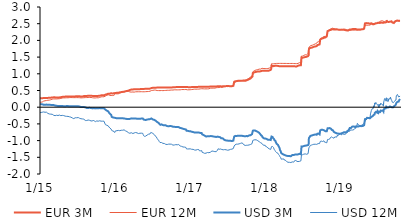
| Category | EUR 3M | EUR 12M | USD 3M | USD 12M |
|---|---|---|---|---|
| 2015-01-02 | 0.264 | 0.147 | 0.084 | -0.163 |
| 2015-01-05 | 0.265 | 0.149 | 0.086 | -0.164 |
| 2015-01-06 | 0.267 | 0.151 | 0.089 | -0.158 |
| 2015-01-07 | 0.27 | 0.151 | 0.088 | -0.157 |
| 2015-01-08 | 0.27 | 0.151 | 0.088 | -0.159 |
| 2015-01-09 | 0.27 | 0.152 | 0.086 | -0.156 |
| 2015-01-12 | 0.269 | 0.153 | 0.087 | -0.151 |
| 2015-01-13 | 0.259 | 0.152 | 0.077 | -0.152 |
| 2015-01-14 | 0.261 | 0.155 | 0.076 | -0.152 |
| 2015-01-15 | 0.261 | 0.157 | 0.077 | -0.145 |
| 2015-01-16 | 0.27 | 0.171 | 0.073 | -0.14 |
| 2015-01-19 | 0.274 | 0.181 | 0.074 | -0.142 |
| 2015-01-20 | 0.275 | 0.186 | 0.073 | -0.146 |
| 2015-01-21 | 0.275 | 0.187 | 0.073 | -0.152 |
| 2015-01-22 | 0.275 | 0.188 | 0.074 | -0.153 |
| 2015-01-23 | 0.275 | 0.188 | 0.074 | -0.153 |
| 2015-01-26 | 0.276 | 0.193 | 0.074 | -0.151 |
| 2015-01-27 | 0.275 | 0.193 | 0.077 | -0.152 |
| 2015-01-28 | 0.277 | 0.197 | 0.075 | -0.148 |
| 2015-01-29 | 0.278 | 0.199 | 0.075 | -0.15 |
| 2015-01-30 | 0.276 | 0.2 | 0.077 | -0.151 |
| 2015-02-02 | 0.275 | 0.199 | 0.078 | -0.149 |
| 2015-02-03 | 0.275 | 0.204 | 0.075 | -0.148 |
| 2015-02-04 | 0.275 | 0.207 | 0.075 | -0.155 |
| 2015-02-05 | 0.279 | 0.208 | 0.074 | -0.159 |
| 2015-02-06 | 0.277 | 0.209 | 0.074 | -0.161 |
| 2015-02-09 | 0.279 | 0.209 | 0.072 | -0.186 |
| 2015-02-10 | 0.28 | 0.208 | 0.072 | -0.194 |
| 2015-02-11 | 0.281 | 0.21 | 0.072 | -0.195 |
| 2015-02-12 | 0.282 | 0.21 | 0.072 | -0.202 |
| 2015-02-13 | 0.282 | 0.211 | 0.073 | -0.204 |
| 2015-02-16 | 0.282 | 0.212 | 0.074 | -0.203 |
| 2015-02-17 | 0.283 | 0.212 | 0.073 | -0.205 |
| 2015-02-18 | 0.282 | 0.215 | 0.069 | -0.214 |
| 2015-02-19 | 0.282 | 0.218 | 0.068 | -0.201 |
| 2015-02-20 | 0.282 | 0.22 | 0.067 | -0.204 |
| 2015-02-23 | 0.285 | 0.224 | 0.068 | -0.208 |
| 2015-02-24 | 0.286 | 0.225 | 0.069 | -0.207 |
| 2015-02-25 | 0.288 | 0.219 | 0.069 | -0.209 |
| 2015-02-26 | 0.29 | 0.222 | 0.068 | -0.209 |
| 2015-02-27 | 0.291 | 0.227 | 0.068 | -0.22 |
| 2015-03-02 | 0.291 | 0.24 | 0.069 | -0.212 |
| 2015-03-03 | 0.292 | 0.242 | 0.065 | -0.217 |
| 2015-03-04 | 0.292 | 0.243 | 0.066 | -0.219 |
| 2015-03-05 | 0.294 | 0.244 | 0.066 | -0.219 |
| 2015-03-06 | 0.294 | 0.245 | 0.065 | -0.218 |
| 2015-03-09 | 0.295 | 0.248 | 0.063 | -0.241 |
| 2015-03-10 | 0.298 | 0.251 | 0.062 | -0.241 |
| 2015-03-11 | 0.301 | 0.243 | 0.06 | -0.255 |
| 2015-03-12 | 0.303 | 0.245 | 0.059 | -0.254 |
| 2015-03-13 | 0.305 | 0.246 | 0.059 | -0.253 |
| 2015-03-16 | 0.295 | 0.248 | 0.05 | -0.253 |
| 2015-03-17 | 0.295 | 0.251 | 0.051 | -0.253 |
| 2015-03-18 | 0.285 | 0.238 | 0.04 | -0.265 |
| 2015-03-19 | 0.286 | 0.241 | 0.045 | -0.237 |
| 2015-03-20 | 0.289 | 0.245 | 0.043 | -0.247 |
| 2015-03-23 | 0.288 | 0.247 | 0.043 | -0.241 |
| 2015-03-24 | 0.289 | 0.248 | 0.041 | -0.242 |
| 2015-03-25 | 0.289 | 0.249 | 0.041 | -0.247 |
| 2015-03-26 | 0.289 | 0.249 | 0.037 | -0.25 |
| 2015-03-27 | 0.289 | 0.251 | 0.035 | -0.252 |
| 2015-03-30 | 0.292 | 0.252 | 0.036 | -0.249 |
| 2015-03-31 | 0.291 | 0.252 | 0.039 | -0.244 |
| 2015-04-01 | 0.292 | 0.254 | 0.039 | -0.248 |
| 2015-04-02 | 0.292 | 0.255 | 0.036 | -0.242 |
| 2015-04-03 | 0.292 | 0.255 | 0.036 | -0.242 |
| 2015-04-07 | 0.294 | 0.255 | 0.036 | -0.236 |
| 2015-04-08 | 0.296 | 0.259 | 0.039 | -0.239 |
| 2015-04-09 | 0.298 | 0.26 | 0.034 | -0.244 |
| 2015-04-10 | 0.298 | 0.262 | 0.033 | -0.248 |
| 2015-04-13 | 0.299 | 0.263 | 0.035 | -0.253 |
| 2015-04-14 | 0.302 | 0.267 | 0.034 | -0.25 |
| 2015-04-15 | 0.306 | 0.27 | 0.036 | -0.243 |
| 2015-04-16 | 0.308 | 0.272 | 0.035 | -0.241 |
| 2015-04-17 | 0.309 | 0.273 | 0.034 | -0.235 |
| 2015-04-20 | 0.309 | 0.274 | 0.034 | -0.245 |
| 2015-04-21 | 0.311 | 0.264 | 0.033 | -0.261 |
| 2015-04-22 | 0.312 | 0.275 | 0.032 | -0.249 |
| 2015-04-23 | 0.312 | 0.277 | 0.033 | -0.256 |
| 2015-04-24 | 0.311 | 0.278 | 0.033 | -0.256 |
| 2015-04-27 | 0.312 | 0.279 | 0.031 | -0.251 |
| 2015-04-28 | 0.315 | 0.282 | 0.032 | -0.246 |
| 2015-04-29 | 0.315 | 0.283 | 0.032 | -0.249 |
| 2015-04-30 | 0.315 | 0.279 | 0.031 | -0.255 |
| 2015-05-04 | 0.317 | 0.28 | 0.03 | -0.268 |
| 2015-05-05 | 0.318 | 0.283 | 0.03 | -0.268 |
| 2015-05-06 | 0.318 | 0.281 | 0.034 | -0.284 |
| 2015-05-07 | 0.319 | 0.281 | 0.031 | -0.286 |
| 2015-05-11 | 0.319 | 0.282 | 0.033 | -0.274 |
| 2015-05-12 | 0.319 | 0.281 | 0.035 | -0.285 |
| 2015-05-13 | 0.319 | 0.281 | 0.036 | -0.28 |
| 2015-05-14 | 0.319 | 0.282 | 0.034 | -0.273 |
| 2015-05-15 | 0.32 | 0.283 | 0.033 | -0.273 |
| 2015-05-18 | 0.321 | 0.282 | 0.034 | -0.275 |
| 2015-05-19 | 0.322 | 0.286 | 0.029 | -0.278 |
| 2015-05-20 | 0.322 | 0.288 | 0.027 | -0.289 |
| 2015-05-21 | 0.322 | 0.288 | 0.028 | -0.289 |
| 2015-05-22 | 0.322 | 0.288 | 0.026 | -0.288 |
| 2015-05-25 | 0.322 | 0.287 | 0.026 | -0.288 |
| 2015-05-26 | 0.323 | 0.289 | 0.024 | -0.307 |
| 2015-05-27 | 0.323 | 0.29 | 0.027 | -0.303 |
| 2015-05-28 | 0.323 | 0.291 | 0.027 | -0.303 |
| 2015-05-29 | 0.322 | 0.29 | 0.026 | -0.3 |
| 2015-06-01 | 0.323 | 0.289 | 0.028 | -0.298 |
| 2015-06-02 | 0.323 | 0.292 | 0.031 | -0.3 |
| 2015-06-03 | 0.324 | 0.29 | 0.031 | -0.295 |
| 2015-06-04 | 0.323 | 0.298 | 0.031 | -0.288 |
| 2015-06-05 | 0.323 | 0.299 | 0.029 | -0.289 |
| 2015-06-08 | 0.323 | 0.287 | 0.028 | -0.322 |
| 2015-06-09 | 0.323 | 0.297 | 0.025 | -0.308 |
| 2015-06-10 | 0.324 | 0.284 | 0.022 | -0.332 |
| 2015-06-11 | 0.324 | 0.289 | 0.024 | -0.338 |
| 2015-06-12 | 0.324 | 0.287 | 0.024 | -0.341 |
| 2015-06-15 | 0.324 | 0.286 | 0.027 | -0.342 |
| 2015-06-16 | 0.324 | 0.284 | 0.024 | -0.34 |
| 2015-06-17 | 0.324 | 0.284 | 0.024 | -0.341 |
| 2015-06-18 | 0.324 | 0.284 | 0.029 | -0.316 |
| 2015-06-19 | 0.324 | 0.284 | 0.029 | -0.317 |
| 2015-06-22 | 0.324 | 0.286 | 0.028 | -0.316 |
| 2015-06-23 | 0.324 | 0.287 | 0.029 | -0.319 |
| 2015-06-24 | 0.324 | 0.287 | 0.029 | -0.326 |
| 2015-06-25 | 0.325 | 0.288 | 0.028 | -0.324 |
| 2015-06-26 | 0.325 | 0.288 | 0.028 | -0.326 |
| 2015-06-29 | 0.326 | 0.287 | 0.026 | -0.316 |
| 2015-06-30 | 0.324 | 0.286 | 0.027 | -0.321 |
| 2015-07-01 | 0.324 | 0.286 | 0.026 | -0.328 |
| 2015-07-02 | 0.325 | 0.287 | 0.027 | -0.337 |
| 2015-07-03 | 0.325 | 0.287 | 0.026 | -0.322 |
| 2015-07-07 | 0.328 | 0.286 | 0.027 | -0.31 |
| 2015-07-08 | 0.328 | 0.286 | 0.027 | -0.3 |
| 2015-07-09 | 0.328 | 0.287 | 0.024 | -0.303 |
| 2015-07-10 | 0.328 | 0.286 | 0.024 | -0.313 |
| 2015-07-13 | 0.329 | 0.284 | 0.021 | -0.331 |
| 2015-07-14 | 0.329 | 0.282 | 0.022 | -0.329 |
| 2015-07-15 | 0.319 | 0.281 | 0.012 | -0.323 |
| 2015-07-16 | 0.319 | 0.281 | 0.013 | -0.323 |
| 2015-07-17 | 0.319 | 0.28 | 0.008 | -0.326 |
| 2015-07-20 | 0.319 | 0.279 | 0.005 | -0.345 |
| 2015-07-21 | 0.319 | 0.28 | 0.006 | -0.355 |
| 2015-07-22 | 0.329 | 0.279 | 0.018 | -0.355 |
| 2015-07-23 | 0.329 | 0.279 | 0.015 | -0.357 |
| 2015-07-24 | 0.319 | 0.28 | 0.006 | -0.357 |
| 2015-07-27 | 0.32 | 0.281 | 0.006 | -0.351 |
| 2015-07-28 | 0.321 | 0.281 | 0.003 | -0.354 |
| 2015-07-29 | 0.322 | 0.281 | 0.003 | -0.351 |
| 2015-07-30 | 0.323 | 0.281 | 0 | -0.364 |
| 2015-07-31 | 0.333 | 0.283 | 0.001 | -0.378 |
| 2015-08-03 | 0.333 | 0.284 | 0.006 | -0.359 |
| 2015-08-04 | 0.333 | 0.286 | 0.009 | -0.355 |
| 2015-08-05 | 0.334 | 0.287 | -0.001 | -0.382 |
| 2015-08-06 | 0.334 | 0.287 | -0.001 | -0.385 |
| 2015-08-07 | 0.334 | 0.287 | -0.002 | -0.386 |
| 2015-08-10 | 0.334 | 0.288 | -0.004 | -0.397 |
| 2015-08-11 | 0.334 | 0.288 | -0.004 | -0.389 |
| 2015-08-12 | 0.334 | 0.289 | 0.001 | -0.372 |
| 2015-08-13 | 0.334 | 0.289 | -0.011 | -0.385 |
| 2015-08-14 | 0.335 | 0.289 | -0.014 | -0.394 |
| 2015-08-17 | 0.337 | 0.289 | -0.023 | -0.399 |
| 2015-08-18 | 0.338 | 0.291 | -0.023 | -0.394 |
| 2015-08-19 | 0.339 | 0.29 | -0.023 | -0.4 |
| 2015-08-20 | 0.34 | 0.291 | -0.019 | -0.408 |
| 2015-08-21 | 0.341 | 0.29 | -0.019 | -0.398 |
| 2015-08-24 | 0.342 | 0.29 | -0.022 | -0.383 |
| 2015-08-25 | 0.343 | 0.289 | -0.017 | -0.377 |
| 2015-08-26 | 0.343 | 0.29 | -0.015 | -0.381 |
| 2015-08-27 | 0.343 | 0.29 | -0.014 | -0.392 |
| 2015-08-28 | 0.343 | 0.289 | -0.019 | -0.393 |
| 2015-08-31 | 0.343 | 0.29 | -0.019 | -0.393 |
| 2015-09-01 | 0.343 | 0.289 | -0.024 | -0.406 |
| 2015-09-02 | 0.343 | 0.29 | -0.023 | -0.404 |
| 2015-09-03 | 0.343 | 0.289 | -0.024 | -0.404 |
| 2015-09-04 | 0.344 | 0.292 | -0.022 | -0.4 |
| 2015-09-07 | 0.344 | 0.292 | -0.023 | -0.41 |
| 2015-09-08 | 0.335 | 0.282 | -0.032 | -0.417 |
| 2015-09-09 | 0.335 | 0.282 | -0.033 | -0.415 |
| 2015-09-10 | 0.336 | 0.283 | -0.036 | -0.415 |
| 2015-09-11 | 0.338 | 0.283 | -0.037 | -0.416 |
| 2015-09-14 | 0.338 | 0.283 | -0.036 | -0.415 |
| 2015-09-15 | 0.336 | 0.285 | -0.034 | -0.415 |
| 2015-09-16 | 0.347 | 0.284 | -0.03 | -0.427 |
| 2015-09-17 | 0.347 | 0.284 | -0.035 | -0.431 |
| 2015-09-18 | 0.347 | 0.286 | -0.009 | -0.385 |
| 2015-09-21 | 0.338 | 0.278 | -0.026 | -0.409 |
| 2015-09-22 | 0.339 | 0.28 | -0.027 | -0.412 |
| 2015-09-23 | 0.339 | 0.283 | -0.026 | -0.416 |
| 2015-09-24 | 0.34 | 0.282 | -0.026 | -0.417 |
| 2015-09-25 | 0.331 | 0.274 | -0.036 | -0.441 |
| 2015-09-29 | 0.331 | 0.277 | -0.036 | -0.432 |
| 2015-09-30 | 0.33 | 0.278 | -0.035 | -0.431 |
| 2015-10-01 | 0.333 | 0.28 | -0.034 | -0.427 |
| 2015-10-02 | 0.334 | 0.281 | -0.037 | -0.432 |
| 2015-10-05 | 0.336 | 0.283 | -0.033 | -0.411 |
| 2015-10-06 | 0.336 | 0.281 | -0.028 | -0.416 |
| 2015-10-07 | 0.336 | 0.28 | -0.029 | -0.42 |
| 2015-10-08 | 0.338 | 0.281 | -0.03 | -0.421 |
| 2015-10-09 | 0.339 | 0.281 | -0.031 | -0.425 |
| 2015-10-12 | 0.339 | 0.281 | -0.031 | -0.42 |
| 2015-10-13 | 0.339 | 0.281 | -0.031 | -0.415 |
| 2015-10-14 | 0.339 | 0.283 | -0.027 | -0.409 |
| 2015-10-15 | 0.342 | 0.286 | -0.025 | -0.396 |
| 2015-10-16 | 0.341 | 0.291 | -0.027 | -0.406 |
| 2015-10-19 | 0.344 | 0.292 | -0.027 | -0.406 |
| 2015-10-20 | 0.343 | 0.291 | -0.03 | -0.408 |
| 2015-10-21 | 0.343 | 0.29 | -0.026 | -0.411 |
| 2015-10-22 | 0.343 | 0.29 | -0.026 | -0.411 |
| 2015-10-23 | 0.343 | 0.29 | -0.026 | -0.411 |
| 2015-10-26 | 0.354 | 0.31 | -0.033 | -0.418 |
| 2015-10-27 | 0.356 | 0.312 | -0.034 | -0.418 |
| 2015-10-29 | 0.356 | 0.312 | -0.034 | -0.418 |
| 2015-10-30 | 0.356 | 0.312 | -0.034 | -0.418 |
| 2015-11-02 | 0.356 | 0.312 | -0.034 | -0.418 |
| 2015-11-03 | 0.356 | 0.312 | -0.034 | -0.418 |
| 2015-11-04 | 0.356 | 0.312 | -0.034 | -0.418 |
| 2015-11-05 | 0.356 | 0.312 | -0.034 | -0.418 |
| 2015-11-06 | 0.356 | 0.312 | -0.034 | -0.418 |
| 2015-11-09 | 0.356 | 0.312 | -0.034 | -0.418 |
| 2015-11-10 | 0.356 | 0.312 | -0.034 | -0.418 |
| 2015-11-11 | 0.356 | 0.312 | -0.034 | -0.418 |
| 2015-11-12 | 0.356 | 0.312 | -0.034 | -0.418 |
| 2015-11-13 | 0.356 | 0.302 | -0.034 | -0.428 |
| 2015-11-16 | 0.376 | 0.333 | -0.074 | -0.522 |
| 2015-11-18 | 0.382 | 0.334 | -0.08 | -0.526 |
| 2015-11-19 | 0.382 | 0.336 | -0.088 | -0.531 |
| 2015-11-20 | 0.385 | 0.352 | -0.092 | -0.527 |
| 2015-11-23 | 0.389 | 0.358 | -0.103 | -0.541 |
| 2015-11-24 | 0.394 | 0.362 | -0.112 | -0.547 |
| 2015-11-25 | 0.394 | 0.35 | -0.117 | -0.563 |
| 2015-11-26 | 0.399 | 0.367 | -0.122 | -0.558 |
| 2015-11-27 | 0.403 | 0.372 | -0.124 | -0.554 |
| 2015-11-30 | 0.404 | 0.372 | -0.126 | -0.561 |
| 2015-12-01 | 0.406 | 0.375 | -0.132 | -0.564 |
| 2015-12-02 | 0.408 | 0.377 | -0.146 | -0.57 |
| 2015-12-03 | 0.414 | 0.381 | -0.162 | -0.591 |
| 2015-12-04 | 0.403 | 0.352 | -0.172 | -0.598 |
| 2015-12-07 | 0.403 | 0.354 | -0.187 | -0.62 |
| 2015-12-08 | 0.406 | 0.353 | -0.196 | -0.625 |
| 2015-12-09 | 0.409 | 0.354 | -0.202 | -0.632 |
| 2015-12-10 | 0.415 | 0.356 | -0.212 | -0.635 |
| 2015-12-11 | 0.418 | 0.357 | -0.222 | -0.647 |
| 2015-12-14 | 0.419 | 0.35 | -0.228 | -0.654 |
| 2015-12-15 | 0.422 | 0.35 | -0.236 | -0.664 |
| 2015-12-16 | 0.423 | 0.351 | -0.242 | -0.674 |
| 2015-12-17 | 0.413 | 0.351 | -0.29 | -0.699 |
| 2015-12-18 | 0.411 | 0.352 | -0.306 | -0.704 |
| 2015-12-21 | 0.41 | 0.349 | -0.313 | -0.716 |
| 2015-12-22 | 0.421 | 0.36 | -0.304 | -0.711 |
| 2015-12-23 | 0.421 | 0.359 | -0.313 | -0.724 |
| 2015-12-28 | 0.421 | 0.36 | -0.313 | -0.728 |
| 2015-12-29 | 0.422 | 0.362 | -0.317 | -0.74 |
| 2015-12-30 | 0.422 | 0.361 | -0.322 | -0.755 |
| 2015-12-31 | 0.421 | 0.36 | -0.323 | -0.758 |
| 2016-01-04 | 0.422 | 0.402 | -0.322 | -0.709 |
| 2016-01-05 | 0.423 | 0.401 | -0.327 | -0.713 |
| 2016-01-06 | 0.426 | 0.404 | -0.33 | -0.705 |
| 2016-01-07 | 0.432 | 0.409 | -0.327 | -0.687 |
| 2016-01-08 | 0.433 | 0.409 | -0.331 | -0.695 |
| 2016-01-11 | 0.433 | 0.4 | -0.332 | -0.704 |
| 2016-01-12 | 0.434 | 0.402 | -0.334 | -0.706 |
| 2016-01-13 | 0.434 | 0.401 | -0.332 | -0.713 |
| 2016-01-14 | 0.433 | 0.402 | -0.331 | -0.709 |
| 2016-01-15 | 0.432 | 0.401 | -0.33 | -0.695 |
| 2016-01-18 | 0.432 | 0.401 | -0.33 | -0.695 |
| 2016-01-19 | 0.432 | 0.401 | -0.33 | -0.695 |
| 2016-01-20 | 0.432 | 0.401 | -0.33 | -0.695 |
| 2016-01-21 | 0.432 | 0.401 | -0.33 | -0.695 |
| 2016-01-22 | 0.432 | 0.401 | -0.33 | -0.695 |
| 2016-01-25 | 0.445 | 0.422 | -0.331 | -0.703 |
| 2016-01-26 | 0.448 | 0.425 | -0.331 | -0.701 |
| 2016-01-27 | 0.449 | 0.428 | -0.328 | -0.7 |
| 2016-01-28 | 0.45 | 0.428 | -0.326 | -0.701 |
| 2016-01-29 | 0.452 | 0.435 | -0.323 | -0.69 |
| 2016-02-01 | 0.452 | 0.44 | -0.329 | -0.69 |
| 2016-02-02 | 0.451 | 0.441 | -0.329 | -0.688 |
| 2016-02-03 | 0.452 | 0.442 | -0.331 | -0.68 |
| 2016-02-04 | 0.456 | 0.448 | -0.33 | -0.679 |
| 2016-02-05 | 0.457 | 0.452 | -0.33 | -0.686 |
| 2016-02-08 | 0.459 | 0.455 | -0.331 | -0.69 |
| 2016-02-09 | 0.451 | 0.454 | -0.34 | -0.681 |
| 2016-02-10 | 0.455 | 0.451 | -0.338 | -0.684 |
| 2016-02-11 | 0.459 | 0.456 | -0.337 | -0.667 |
| 2016-02-12 | 0.463 | 0.459 | -0.338 | -0.666 |
| 2016-02-15 | 0.463 | 0.458 | -0.338 | -0.678 |
| 2016-02-16 | 0.467 | 0.462 | -0.338 | -0.682 |
| 2016-02-17 | 0.469 | 0.461 | -0.339 | -0.685 |
| 2016-02-18 | 0.475 | 0.464 | -0.338 | -0.692 |
| 2016-02-19 | 0.478 | 0.467 | -0.338 | -0.69 |
| 2016-02-22 | 0.479 | 0.468 | -0.345 | -0.709 |
| 2016-02-23 | 0.48 | 0.466 | -0.349 | -0.707 |
| 2016-02-24 | 0.481 | 0.465 | -0.355 | -0.705 |
| 2016-02-25 | 0.481 | 0.465 | -0.356 | -0.71 |
| 2016-02-26 | 0.482 | 0.467 | -0.355 | -0.711 |
| 2016-02-29 | 0.485 | 0.474 | -0.353 | -0.729 |
| 2016-03-01 | 0.487 | 0.476 | -0.352 | -0.729 |
| 2016-03-02 | 0.488 | 0.474 | -0.355 | -0.746 |
| 2016-03-03 | 0.493 | 0.475 | -0.356 | -0.75 |
| 2016-03-04 | 0.495 | 0.478 | -0.353 | -0.744 |
| 2016-03-07 | 0.496 | 0.474 | -0.356 | -0.762 |
| 2016-03-08 | 0.501 | 0.475 | -0.355 | -0.757 |
| 2016-03-09 | 0.504 | 0.473 | -0.355 | -0.759 |
| 2016-03-10 | 0.509 | 0.475 | -0.352 | -0.761 |
| 2016-03-11 | 0.515 | 0.459 | -0.344 | -0.774 |
| 2016-03-14 | 0.516 | 0.458 | -0.35 | -0.781 |
| 2016-03-15 | 0.517 | 0.456 | -0.352 | -0.787 |
| 2016-03-16 | 0.52 | 0.454 | -0.349 | -0.795 |
| 2016-03-17 | 0.524 | 0.453 | -0.333 | -0.752 |
| 2016-03-18 | 0.525 | 0.453 | -0.334 | -0.761 |
| 2016-03-21 | 0.528 | 0.452 | -0.335 | -0.764 |
| 2016-03-22 | 0.529 | 0.452 | -0.338 | -0.774 |
| 2016-03-23 | 0.531 | 0.453 | -0.34 | -0.787 |
| 2016-03-24 | 0.532 | 0.455 | -0.339 | -0.781 |
| 2016-03-29 | 0.532 | 0.456 | -0.341 | -0.789 |
| 2016-03-30 | 0.533 | 0.454 | -0.335 | -0.764 |
| 2016-03-31 | 0.534 | 0.455 | -0.339 | -0.76 |
| 2016-04-01 | 0.535 | 0.452 | -0.339 | -0.763 |
| 2016-04-04 | 0.536 | 0.451 | -0.34 | -0.772 |
| 2016-04-05 | 0.538 | 0.454 | -0.337 | -0.755 |
| 2016-04-06 | 0.538 | 0.455 | -0.341 | -0.762 |
| 2016-04-07 | 0.537 | 0.457 | -0.339 | -0.756 |
| 2016-04-08 | 0.538 | 0.46 | -0.341 | -0.755 |
| 2016-04-11 | 0.541 | 0.461 | -0.34 | -0.758 |
| 2016-04-12 | 0.539 | 0.462 | -0.34 | -0.759 |
| 2016-04-13 | 0.539 | 0.463 | -0.338 | -0.768 |
| 2016-04-14 | 0.541 | 0.461 | -0.343 | -0.771 |
| 2016-04-15 | 0.539 | 0.461 | -0.343 | -0.771 |
| 2016-04-18 | 0.539 | 0.462 | -0.344 | -0.768 |
| 2016-04-19 | 0.54 | 0.461 | -0.345 | -0.775 |
| 2016-04-20 | 0.54 | 0.461 | -0.345 | -0.775 |
| 2016-04-21 | 0.54 | 0.461 | -0.345 | -0.775 |
| 2016-04-22 | 0.54 | 0.461 | -0.345 | -0.775 |
| 2016-04-25 | 0.54 | 0.463 | -0.344 | -0.789 |
| 2016-04-26 | 0.542 | 0.464 | -0.344 | -0.793 |
| 2016-04-27 | 0.541 | 0.461 | -0.348 | -0.794 |
| 2016-04-28 | 0.542 | 0.462 | -0.347 | -0.78 |
| 2016-04-29 | 0.541 | 0.462 | -0.347 | -0.78 |
| 2016-05-02 | 0.54 | 0.462 | -0.347 | -0.78 |
| 2016-05-03 | 0.541 | 0.462 | -0.343 | -0.782 |
| 2016-05-04 | 0.543 | 0.462 | -0.344 | -0.78 |
| 2016-05-05 | 0.545 | 0.463 | -0.342 | -0.78 |
| 2016-05-06 | 0.546 | 0.463 | -0.34 | -0.774 |
| 2016-05-09 | 0.548 | 0.464 | -0.34 | -0.777 |
| 2016-05-10 | 0.55 | 0.463 | -0.338 | -0.774 |
| 2016-05-11 | 0.549 | 0.462 | -0.337 | -0.775 |
| 2016-05-12 | 0.548 | 0.462 | -0.336 | -0.777 |
| 2016-05-13 | 0.547 | 0.462 | -0.338 | -0.779 |
| 2016-05-16 | 0.547 | 0.462 | -0.336 | -0.783 |
| 2016-05-17 | 0.547 | 0.461 | -0.335 | -0.792 |
| 2016-05-18 | 0.547 | 0.461 | -0.346 | -0.82 |
| 2016-05-19 | 0.548 | 0.461 | -0.364 | -0.848 |
| 2016-05-20 | 0.548 | 0.461 | -0.371 | -0.852 |
| 2016-05-23 | 0.548 | 0.462 | -0.372 | -0.853 |
| 2016-05-24 | 0.548 | 0.462 | -0.375 | -0.862 |
| 2016-05-25 | 0.548 | 0.463 | -0.377 | -0.873 |
| 2016-05-26 | 0.548 | 0.464 | -0.384 | -0.871 |
| 2016-05-27 | 0.55 | 0.465 | -0.383 | -0.867 |
| 2016-05-30 | 0.551 | 0.465 | -0.383 | -0.867 |
| 2016-05-31 | 0.551 | 0.465 | -0.396 | -0.887 |
| 2016-06-01 | 0.551 | 0.468 | -0.391 | -0.878 |
| 2016-06-02 | 0.552 | 0.467 | -0.39 | -0.882 |
| 2016-06-03 | 0.551 | 0.466 | -0.392 | -0.881 |
| 2016-06-06 | 0.552 | 0.468 | -0.371 | -0.836 |
| 2016-06-07 | 0.551 | 0.468 | -0.367 | -0.835 |
| 2016-06-08 | 0.554 | 0.468 | -0.368 | -0.828 |
| 2016-06-09 | 0.552 | 0.468 | -0.366 | -0.824 |
| 2016-06-10 | 0.553 | 0.468 | -0.366 | -0.824 |
| 2016-06-13 | 0.553 | 0.47 | -0.362 | -0.809 |
| 2016-06-14 | 0.552 | 0.471 | -0.365 | -0.803 |
| 2016-06-15 | 0.552 | 0.471 | -0.366 | -0.815 |
| 2016-06-16 | 0.554 | 0.476 | -0.357 | -0.788 |
| 2016-06-17 | 0.555 | 0.476 | -0.354 | -0.791 |
| 2016-06-20 | 0.556 | 0.478 | -0.356 | -0.802 |
| 2016-06-21 | 0.556 | 0.479 | -0.352 | -0.802 |
| 2016-06-22 | 0.558 | 0.479 | -0.35 | -0.801 |
| 2016-06-23 | 0.559 | 0.479 | -0.35 | -0.8 |
| 2016-06-24 | 0.571 | 0.497 | -0.334 | -0.755 |
| 2016-06-27 | 0.573 | 0.498 | -0.337 | -0.746 |
| 2016-06-28 | 0.571 | 0.499 | -0.341 | -0.755 |
| 2016-06-29 | 0.572 | 0.501 | -0.356 | -0.766 |
| 2016-06-30 | 0.576 | 0.501 | -0.364 | -0.78 |
| 2016-07-01 | 0.58 | 0.502 | -0.363 | -0.775 |
| 2016-07-04 | 0.581 | 0.505 | -0.366 | -0.785 |
| 2016-07-07 | 0.583 | 0.513 | -0.375 | -0.796 |
| 2016-07-08 | 0.583 | 0.509 | -0.377 | -0.803 |
| 2016-07-11 | 0.582 | 0.513 | -0.379 | -0.82 |
| 2016-07-12 | 0.581 | 0.511 | -0.383 | -0.834 |
| 2016-07-13 | 0.585 | 0.511 | -0.39 | -0.843 |
| 2016-07-14 | 0.585 | 0.511 | -0.389 | -0.848 |
| 2016-07-15 | 0.583 | 0.507 | -0.398 | -0.858 |
| 2016-07-18 | 0.585 | 0.511 | -0.406 | -0.876 |
| 2016-07-19 | 0.585 | 0.509 | -0.407 | -0.879 |
| 2016-07-20 | 0.585 | 0.509 | -0.407 | -0.879 |
| 2016-07-21 | 0.585 | 0.509 | -0.407 | -0.879 |
| 2016-07-22 | 0.585 | 0.509 | -0.407 | -0.879 |
| 2016-07-25 | 0.587 | 0.499 | -0.444 | -0.936 |
| 2016-07-26 | 0.588 | 0.498 | -0.453 | -0.949 |
| 2016-07-27 | 0.588 | 0.499 | -0.461 | -0.964 |
| 2016-07-28 | 0.586 | 0.499 | -0.466 | -0.97 |
| 2016-07-29 | 0.587 | 0.499 | -0.469 | -0.982 |
| 2016-08-01 | 0.587 | 0.498 | -0.469 | -0.984 |
| 2016-08-02 | 0.588 | 0.498 | -0.478 | -0.993 |
| 2016-08-03 | 0.589 | 0.497 | -0.488 | -1.005 |
| 2016-08-04 | 0.588 | 0.495 | -0.498 | -1.027 |
| 2016-08-05 | 0.588 | 0.497 | -0.502 | -1.025 |
| 2016-08-08 | 0.588 | 0.496 | -0.516 | -1.058 |
| 2016-08-09 | 0.588 | 0.497 | -0.526 | -1.072 |
| 2016-08-10 | 0.587 | 0.498 | -0.528 | -1.074 |
| 2016-08-11 | 0.589 | 0.499 | -0.527 | -1.07 |
| 2016-08-12 | 0.589 | 0.499 | -0.528 | -1.076 |
| 2016-08-15 | 0.588 | 0.5 | -0.514 | -1.057 |
| 2016-08-16 | 0.589 | 0.5 | -0.511 | -1.048 |
| 2016-08-17 | 0.588 | 0.499 | -0.521 | -1.07 |
| 2016-08-18 | 0.589 | 0.498 | -0.521 | -1.065 |
| 2016-08-19 | 0.588 | 0.497 | -0.527 | -1.073 |
| 2016-08-22 | 0.589 | 0.496 | -0.535 | -1.083 |
| 2016-08-23 | 0.588 | 0.497 | -0.535 | -1.081 |
| 2016-08-24 | 0.588 | 0.498 | -0.535 | -1.077 |
| 2016-08-25 | 0.588 | 0.499 | -0.539 | -1.076 |
| 2016-08-26 | 0.588 | 0.5 | -0.543 | -1.087 |
| 2016-08-29 | 0.587 | 0.5 | -0.543 | -1.087 |
| 2016-08-30 | 0.589 | 0.501 | -0.552 | -1.109 |
| 2016-08-31 | 0.589 | 0.502 | -0.549 | -1.107 |
| 2016-09-01 | 0.589 | 0.501 | -0.546 | -1.116 |
| 2016-09-02 | 0.591 | 0.502 | -0.545 | -1.109 |
| 2016-09-05 | 0.591 | 0.502 | -0.543 | -1.112 |
| 2016-09-06 | 0.593 | 0.504 | -0.551 | -1.111 |
| 2016-09-07 | 0.593 | 0.509 | -0.544 | -1.089 |
| 2016-09-08 | 0.594 | 0.51 | -0.555 | -1.09 |
| 2016-09-09 | 0.591 | 0.507 | -0.562 | -1.107 |
| 2016-09-12 | 0.593 | 0.507 | -0.566 | -1.116 |
| 2016-09-13 | 0.592 | 0.505 | -0.56 | -1.104 |
| 2016-09-14 | 0.593 | 0.504 | -0.564 | -1.106 |
| 2016-09-15 | 0.591 | 0.503 | -0.567 | -1.1 |
| 2016-09-16 | 0.591 | 0.504 | -0.567 | -1.095 |
| 2016-09-19 | 0.591 | 0.506 | -0.571 | -1.106 |
| 2016-09-20 | 0.591 | 0.507 | -0.576 | -1.115 |
| 2016-09-21 | 0.591 | 0.508 | -0.573 | -1.121 |
| 2016-09-22 | 0.591 | 0.509 | -0.567 | -1.111 |
| 2016-09-23 | 0.592 | 0.509 | -0.563 | -1.107 |
| 2016-09-26 | 0.593 | 0.51 | -0.563 | -1.105 |
| 2016-09-27 | 0.591 | 0.51 | -0.564 | -1.101 |
| 2016-09-29 | 0.591 | 0.514 | -0.556 | -1.106 |
| 2016-09-30 | 0.591 | 0.514 | -0.564 | -1.102 |
| 2016-10-03 | 0.591 | 0.514 | -0.568 | -1.109 |
| 2016-10-04 | 0.591 | 0.514 | -0.574 | -1.116 |
| 2016-10-05 | 0.592 | 0.514 | -0.578 | -1.123 |
| 2016-10-06 | 0.594 | 0.514 | -0.582 | -1.131 |
| 2016-10-07 | 0.594 | 0.513 | -0.586 | -1.137 |
| 2016-10-10 | 0.595 | 0.514 | -0.584 | -1.136 |
| 2016-10-11 | 0.596 | 0.516 | -0.587 | -1.141 |
| 2016-10-12 | 0.599 | 0.519 | -0.591 | -1.146 |
| 2016-10-13 | 0.601 | 0.521 | -0.59 | -1.137 |
| 2016-10-14 | 0.601 | 0.522 | -0.592 | -1.136 |
| 2016-10-17 | 0.601 | 0.521 | -0.588 | -1.131 |
| 2016-10-18 | 0.602 | 0.523 | -0.591 | -1.121 |
| 2016-10-19 | 0.603 | 0.523 | -0.591 | -1.114 |
| 2016-10-20 | 0.603 | 0.523 | -0.592 | -1.116 |
| 2016-10-21 | 0.602 | 0.524 | -0.592 | -1.122 |
| 2016-10-24 | 0.601 | 0.52 | -0.594 | -1.121 |
| 2016-10-25 | 0.602 | 0.521 | -0.596 | -1.128 |
| 2016-10-26 | 0.603 | 0.52 | -0.6 | -1.13 |
| 2016-10-27 | 0.602 | 0.52 | -0.597 | -1.132 |
| 2016-10-31 | 0.603 | 0.519 | -0.594 | -1.125 |
| 2016-11-01 | 0.603 | 0.519 | -0.591 | -1.126 |
| 2016-11-02 | 0.603 | 0.521 | -0.586 | -1.115 |
| 2016-11-03 | 0.603 | 0.521 | -0.591 | -1.11 |
| 2016-11-04 | 0.602 | 0.521 | -0.593 | -1.109 |
| 2016-11-07 | 0.602 | 0.52 | -0.597 | -1.118 |
| 2016-11-08 | 0.602 | 0.52 | -0.592 | -1.118 |
| 2016-11-09 | 0.602 | 0.52 | -0.596 | -1.106 |
| 2016-11-10 | 0.602 | 0.521 | -0.612 | -1.133 |
| 2016-11-11 | 0.602 | 0.519 | -0.616 | -1.138 |
| 2016-11-14 | 0.602 | 0.52 | -0.621 | -1.16 |
| 2016-11-15 | 0.602 | 0.521 | -0.616 | -1.155 |
| 2016-11-16 | 0.601 | 0.523 | -0.619 | -1.162 |
| 2016-11-18 | 0.603 | 0.527 | -0.626 | -1.171 |
| 2016-11-21 | 0.602 | 0.528 | -0.63 | -1.173 |
| 2016-11-22 | 0.603 | 0.529 | -0.635 | -1.178 |
| 2016-11-23 | 0.603 | 0.528 | -0.64 | -1.18 |
| 2016-11-24 | 0.604 | 0.529 | -0.647 | -1.193 |
| 2016-11-25 | 0.604 | 0.529 | -0.647 | -1.195 |
| 2016-11-28 | 0.604 | 0.529 | -0.645 | -1.191 |
| 2016-11-29 | 0.604 | 0.529 | -0.641 | -1.191 |
| 2016-11-30 | 0.604 | 0.53 | -0.644 | -1.189 |
| 2016-12-01 | 0.603 | 0.529 | -0.652 | -1.193 |
| 2016-12-02 | 0.603 | 0.526 | -0.656 | -1.195 |
| 2016-12-05 | 0.603 | 0.528 | -0.658 | -1.194 |
| 2016-12-06 | 0.605 | 0.529 | -0.661 | -1.196 |
| 2016-12-07 | 0.606 | 0.528 | -0.661 | -1.195 |
| 2016-12-08 | 0.608 | 0.528 | -0.663 | -1.195 |
| 2016-12-09 | 0.606 | 0.531 | -0.667 | -1.198 |
| 2016-12-12 | 0.606 | 0.531 | -0.669 | -1.205 |
| 2016-12-13 | 0.606 | 0.531 | -0.673 | -1.204 |
| 2016-12-14 | 0.606 | 0.532 | -0.68 | -1.205 |
| 2016-12-15 | 0.606 | 0.531 | -0.703 | -1.25 |
| 2016-12-16 | 0.604 | 0.531 | -0.707 | -1.243 |
| 2016-12-19 | 0.603 | 0.521 | -0.704 | -1.252 |
| 2016-12-20 | 0.603 | 0.521 | -0.706 | -1.251 |
| 2016-12-21 | 0.605 | 0.522 | -0.708 | -1.25 |
| 2016-12-22 | 0.596 | 0.522 | -0.717 | -1.248 |
| 2016-12-23 | 0.597 | 0.522 | -0.717 | -1.25 |
| 2016-12-27 | 0.598 | 0.521 | -0.717 | -1.25 |
| 2016-12-28 | 0.589 | 0.512 | -0.728 | -1.26 |
| 2016-12-29 | 0.599 | 0.521 | -0.718 | -1.247 |
| 2016-12-30 | 0.599 | 0.522 | -0.718 | -1.246 |
| 2017-01-02 | 0.598 | 0.523 | -0.718 | -1.246 |
| 2017-01-03 | 0.599 | 0.524 | -0.719 | -1.249 |
| 2017-01-04 | 0.6 | 0.525 | -0.725 | -1.249 |
| 2017-01-05 | 0.601 | 0.525 | -0.729 | -1.249 |
| 2017-01-06 | 0.601 | 0.527 | -0.73 | -1.245 |
| 2017-01-09 | 0.602 | 0.528 | -0.735 | -1.261 |
| 2017-01-10 | 0.604 | 0.53 | -0.738 | -1.262 |
| 2017-01-11 | 0.606 | 0.531 | -0.742 | -1.263 |
| 2017-01-12 | 0.607 | 0.533 | -0.742 | -1.258 |
| 2017-01-13 | 0.607 | 0.534 | -0.743 | -1.258 |
| 2017-01-16 | 0.608 | 0.535 | -0.744 | -1.262 |
| 2017-01-17 | 0.609 | 0.538 | -0.745 | -1.262 |
| 2017-01-18 | 0.609 | 0.539 | -0.75 | -1.27 |
| 2017-01-19 | 0.609 | 0.54 | -0.761 | -1.288 |
| 2017-01-20 | 0.609 | 0.54 | -0.761 | -1.288 |
| 2017-01-23 | 0.607 | 0.541 | -0.758 | -1.281 |
| 2017-01-24 | 0.608 | 0.541 | -0.752 | -1.267 |
| 2017-01-25 | 0.608 | 0.541 | -0.757 | -1.279 |
| 2017-01-26 | 0.608 | 0.542 | -0.759 | -1.288 |
| 2017-01-27 | 0.608 | 0.541 | -0.759 | -1.284 |
| 2017-01-30 | 0.608 | 0.54 | -0.754 | -1.285 |
| 2017-01-31 | 0.607 | 0.541 | -0.755 | -1.273 |
| 2017-02-01 | 0.608 | 0.543 | -0.755 | -1.275 |
| 2017-02-02 | 0.608 | 0.542 | -0.754 | -1.272 |
| 2017-02-03 | 0.608 | 0.541 | -0.754 | -1.273 |
| 2017-02-06 | 0.608 | 0.541 | -0.758 | -1.267 |
| 2017-02-07 | 0.608 | 0.541 | -0.758 | -1.265 |
| 2017-02-08 | 0.608 | 0.541 | -0.754 | -1.26 |
| 2017-02-09 | 0.608 | 0.541 | -0.754 | -1.254 |
| 2017-02-10 | 0.609 | 0.541 | -0.756 | -1.263 |
| 2017-02-13 | 0.609 | 0.542 | -0.759 | -1.27 |
| 2017-02-14 | 0.608 | 0.544 | -0.757 | -1.268 |
| 2017-02-15 | 0.608 | 0.544 | -0.762 | -1.284 |
| 2017-02-16 | 0.608 | 0.546 | -0.776 | -1.305 |
| 2017-02-17 | 0.609 | 0.549 | -0.772 | -1.295 |
| 2017-02-20 | 0.609 | 0.549 | -0.77 | -1.295 |
| 2017-02-21 | 0.609 | 0.551 | -0.773 | -1.305 |
| 2017-02-22 | 0.61 | 0.551 | -0.774 | -1.306 |
| 2017-02-23 | 0.609 | 0.551 | -0.772 | -1.304 |
| 2017-02-24 | 0.609 | 0.553 | -0.774 | -1.3 |
| 2017-02-27 | 0.609 | 0.553 | -0.775 | -1.3 |
| 2017-02-28 | 0.61 | 0.554 | -0.784 | -1.316 |
| 2017-03-01 | 0.609 | 0.554 | -0.813 | -1.35 |
| 2017-03-02 | 0.609 | 0.554 | -0.82 | -1.358 |
| 2017-03-03 | 0.609 | 0.553 | -0.822 | -1.368 |
| 2017-03-06 | 0.609 | 0.551 | -0.826 | -1.36 |
| 2017-03-07 | 0.608 | 0.551 | -0.826 | -1.36 |
| 2017-03-08 | 0.609 | 0.551 | -0.829 | -1.361 |
| 2017-03-09 | 0.609 | 0.551 | -0.84 | -1.374 |
| 2017-03-10 | 0.609 | 0.549 | -0.841 | -1.378 |
| 2017-03-13 | 0.61 | 0.548 | -0.851 | -1.381 |
| 2017-03-14 | 0.61 | 0.548 | -0.857 | -1.383 |
| 2017-03-15 | 0.609 | 0.55 | -0.868 | -1.388 |
| 2017-03-16 | 0.609 | 0.551 | -0.872 | -1.374 |
| 2017-03-17 | 0.609 | 0.549 | -0.872 | -1.373 |
| 2017-03-20 | 0.609 | 0.549 | -0.876 | -1.376 |
| 2017-03-21 | 0.609 | 0.546 | -0.876 | -1.375 |
| 2017-03-22 | 0.61 | 0.546 | -0.877 | -1.367 |
| 2017-03-23 | 0.61 | 0.547 | -0.873 | -1.364 |
| 2017-03-24 | 0.61 | 0.547 | -0.871 | -1.363 |
| 2017-03-27 | 0.61 | 0.549 | -0.872 | -1.357 |
| 2017-03-28 | 0.61 | 0.55 | -0.872 | -1.358 |
| 2017-03-29 | 0.61 | 0.549 | -0.867 | -1.354 |
| 2017-03-30 | 0.61 | 0.549 | -0.868 | -1.353 |
| 2017-03-31 | 0.609 | 0.549 | -0.87 | -1.362 |
| 2017-04-03 | 0.61 | 0.551 | -0.87 | -1.363 |
| 2017-04-04 | 0.61 | 0.551 | -0.87 | -1.352 |
| 2017-04-05 | 0.609 | 0.554 | -0.87 | -1.356 |
| 2017-04-06 | 0.61 | 0.555 | -0.875 | -1.358 |
| 2017-04-07 | 0.62 | 0.556 | -0.868 | -1.359 |
| 2017-04-10 | 0.622 | 0.568 | -0.866 | -1.348 |
| 2017-04-11 | 0.622 | 0.569 | -0.865 | -1.339 |
| 2017-04-12 | 0.622 | 0.57 | -0.868 | -1.333 |
| 2017-04-13 | 0.621 | 0.57 | -0.868 | -1.322 |
| 2017-04-18 | 0.621 | 0.572 | -0.866 | -1.311 |
| 2017-04-19 | 0.622 | 0.573 | -0.866 | -1.286 |
| 2017-04-20 | 0.622 | 0.574 | -0.863 | -1.289 |
| 2017-04-21 | 0.621 | 0.574 | -0.866 | -1.295 |
| 2017-04-24 | 0.619 | 0.571 | -0.876 | -1.318 |
| 2017-04-25 | 0.619 | 0.571 | -0.88 | -1.325 |
| 2017-04-26 | 0.619 | 0.571 | -0.882 | -1.333 |
| 2017-04-27 | 0.619 | 0.571 | -0.88 | -1.326 |
| 2017-04-28 | 0.619 | 0.571 | -0.882 | -1.324 |
| 2017-05-02 | 0.619 | 0.571 | -0.884 | -1.33 |
| 2017-05-03 | 0.619 | 0.575 | -0.881 | -1.32 |
| 2017-05-04 | 0.619 | 0.576 | -0.889 | -1.331 |
| 2017-05-05 | 0.619 | 0.574 | -0.89 | -1.329 |
| 2017-05-09 | 0.619 | 0.583 | -0.892 | -1.331 |
| 2017-05-10 | 0.619 | 0.584 | -0.891 | -1.328 |
| 2017-05-11 | 0.629 | 0.584 | -0.882 | -1.326 |
| 2017-05-12 | 0.629 | 0.587 | -0.88 | -1.306 |
| 2017-05-15 | 0.63 | 0.587 | -0.879 | -1.285 |
| 2017-05-16 | 0.631 | 0.588 | -0.881 | -1.285 |
| 2017-05-17 | 0.631 | 0.589 | -0.878 | -1.273 |
| 2017-05-18 | 0.631 | 0.589 | -0.872 | -1.245 |
| 2017-05-19 | 0.631 | 0.589 | -0.886 | -1.263 |
| 2017-05-22 | 0.629 | 0.589 | -0.892 | -1.266 |
| 2017-05-23 | 0.63 | 0.589 | -0.889 | -1.26 |
| 2017-05-24 | 0.629 | 0.599 | -0.898 | -1.256 |
| 2017-05-25 | 0.629 | 0.599 | -0.9 | -1.253 |
| 2017-05-26 | 0.629 | 0.6 | -0.902 | -1.251 |
| 2017-05-29 | 0.629 | 0.601 | -0.902 | -1.251 |
| 2017-05-30 | 0.629 | 0.591 | -0.902 | -1.262 |
| 2017-05-31 | 0.629 | 0.591 | -0.91 | -1.264 |
| 2017-06-01 | 0.629 | 0.591 | -0.918 | -1.266 |
| 2017-06-02 | 0.619 | 0.591 | -0.932 | -1.271 |
| 2017-06-05 | 0.619 | 0.591 | -0.93 | -1.266 |
| 2017-06-06 | 0.619 | 0.593 | -0.929 | -1.263 |
| 2017-06-07 | 0.619 | 0.594 | -0.931 | -1.264 |
| 2017-06-08 | 0.62 | 0.594 | -0.938 | -1.268 |
| 2017-06-09 | 0.631 | 0.6 | -0.936 | -1.268 |
| 2017-06-12 | 0.631 | 0.607 | -0.942 | -1.276 |
| 2017-06-13 | 0.631 | 0.609 | -0.946 | -1.276 |
| 2017-06-14 | 0.631 | 0.612 | -0.95 | -1.276 |
| 2017-06-15 | 0.629 | 0.612 | -0.967 | -1.27 |
| 2017-06-16 | 0.629 | 0.614 | -0.974 | -1.272 |
| 2017-06-19 | 0.629 | 0.616 | -0.98 | -1.268 |
| 2017-06-20 | 0.629 | 0.619 | -0.987 | -1.276 |
| 2017-06-21 | 0.629 | 0.621 | -0.989 | -1.275 |
| 2017-06-22 | 0.63 | 0.621 | -0.996 | -1.278 |
| 2017-06-23 | 0.631 | 0.623 | -0.993 | -1.273 |
| 2017-06-26 | 0.631 | 0.621 | -0.995 | -1.275 |
| 2017-06-27 | 0.631 | 0.621 | -0.995 | -1.273 |
| 2017-06-28 | 0.631 | 0.618 | -0.996 | -1.277 |
| 2017-06-29 | 0.621 | 0.616 | -1.009 | -1.28 |
| 2017-06-30 | 0.631 | 0.616 | -0.999 | -1.278 |
| 2017-07-03 | 0.631 | 0.617 | -1.001 | -1.288 |
| 2017-07-04 | 0.629 | 0.619 | -1.002 | -1.291 |
| 2017-07-07 | 0.631 | 0.631 | -1.005 | -1.288 |
| 2017-07-10 | 0.631 | 0.626 | -1.004 | -1.281 |
| 2017-07-11 | 0.631 | 0.625 | -1.004 | -1.282 |
| 2017-07-12 | 0.631 | 0.624 | -1.004 | -1.276 |
| 2017-07-13 | 0.631 | 0.621 | -1.004 | -1.268 |
| 2017-07-14 | 0.631 | 0.621 | -1.004 | -1.27 |
| 2017-07-17 | 0.63 | 0.621 | -1.006 | -1.263 |
| 2017-07-18 | 0.631 | 0.621 | -1.007 | -1.263 |
| 2017-07-19 | 0.632 | 0.621 | -1.007 | -1.263 |
| 2017-07-20 | 0.632 | 0.621 | -1.007 | -1.263 |
| 2017-07-21 | 0.632 | 0.621 | -1.007 | -1.263 |
| 2017-07-24 | 0.629 | 0.633 | -1.014 | -1.256 |
| 2017-07-25 | 0.629 | 0.633 | -1.017 | -1.259 |
| 2017-07-26 | 0.63 | 0.633 | -1.014 | -1.256 |
| 2017-07-27 | 0.629 | 0.633 | -1.011 | -1.25 |
| 2017-07-28 | 0.639 | 0.632 | -1.001 | -1.249 |
| 2017-07-31 | 0.64 | 0.641 | -1.001 | -1.237 |
| 2017-08-01 | 0.641 | 0.641 | -1.001 | -1.236 |
| 2017-08-02 | 0.641 | 0.643 | -1.003 | -1.236 |
| 2017-08-03 | 0.639 | 0.642 | -1.002 | -1.236 |
| 2017-08-04 | 0.759 | 0.711 | -0.882 | -1.163 |
| 2017-08-07 | 0.768 | 0.742 | -0.871 | -1.142 |
| 2017-08-08 | 0.768 | 0.752 | -0.869 | -1.13 |
| 2017-08-09 | 0.778 | 0.753 | -0.859 | -1.128 |
| 2017-08-10 | 0.779 | 0.764 | -0.859 | -1.118 |
| 2017-08-11 | 0.779 | 0.766 | -0.865 | -1.115 |
| 2017-08-14 | 0.779 | 0.768 | -0.864 | -1.108 |
| 2017-08-15 | 0.779 | 0.767 | -0.864 | -1.118 |
| 2017-08-16 | 0.779 | 0.777 | -0.867 | -1.116 |
| 2017-08-17 | 0.789 | 0.778 | -0.856 | -1.113 |
| 2017-08-18 | 0.789 | 0.778 | -0.855 | -1.106 |
| 2017-08-21 | 0.789 | 0.778 | -0.854 | -1.107 |
| 2017-08-22 | 0.788 | 0.788 | -0.857 | -1.097 |
| 2017-08-23 | 0.789 | 0.789 | -0.857 | -1.098 |
| 2017-08-24 | 0.789 | 0.789 | -0.857 | -1.093 |
| 2017-08-25 | 0.789 | 0.789 | -0.858 | -1.098 |
| 2017-08-28 | 0.789 | 0.789 | -0.858 | -1.098 |
| 2017-08-29 | 0.79 | 0.79 | -0.857 | -1.084 |
| 2017-08-30 | 0.79 | 0.791 | -0.856 | -1.082 |
| 2017-08-31 | 0.789 | 0.791 | -0.858 | -1.083 |
| 2017-09-01 | 0.789 | 0.791 | -0.856 | -1.082 |
| 2017-09-04 | 0.789 | 0.791 | -0.856 | -1.083 |
| 2017-09-05 | 0.789 | 0.791 | -0.857 | -1.085 |
| 2017-09-06 | 0.789 | 0.793 | -0.857 | -1.078 |
| 2017-09-07 | 0.79 | 0.792 | -0.857 | -1.079 |
| 2017-09-08 | 0.791 | 0.796 | -0.85 | -1.065 |
| 2017-09-11 | 0.791 | 0.798 | -0.857 | -1.069 |
| 2017-09-12 | 0.79 | 0.809 | -0.859 | -1.07 |
| 2017-09-13 | 0.789 | 0.809 | -0.86 | -1.072 |
| 2017-09-14 | 0.789 | 0.811 | -0.861 | -1.08 |
| 2017-09-15 | 0.789 | 0.811 | -0.864 | -1.092 |
| 2017-09-18 | 0.789 | 0.811 | -0.865 | -1.1 |
| 2017-09-19 | 0.79 | 0.811 | -0.866 | -1.104 |
| 2017-09-20 | 0.789 | 0.811 | -0.863 | -1.107 |
| 2017-09-21 | 0.79 | 0.811 | -0.868 | -1.128 |
| 2017-09-22 | 0.789 | 0.811 | -0.869 | -1.135 |
| 2017-09-25 | 0.789 | 0.811 | -0.87 | -1.135 |
| 2017-09-26 | 0.789 | 0.811 | -0.871 | -1.136 |
| 2017-09-27 | 0.799 | 0.811 | -0.863 | -1.145 |
| 2017-09-29 | 0.799 | 0.822 | -0.864 | -1.132 |
| 2017-10-02 | 0.799 | 0.822 | -0.866 | -1.141 |
| 2017-10-03 | 0.8 | 0.821 | -0.872 | -1.149 |
| 2017-10-04 | 0.799 | 0.818 | -0.877 | -1.148 |
| 2017-10-05 | 0.809 | 0.831 | -0.869 | -1.14 |
| 2017-10-06 | 0.819 | 0.833 | -0.86 | -1.145 |
| 2017-10-09 | 0.819 | 0.846 | -0.866 | -1.139 |
| 2017-10-10 | 0.819 | 0.851 | -0.867 | -1.137 |
| 2017-10-11 | 0.819 | 0.841 | -0.869 | -1.15 |
| 2017-10-12 | 0.819 | 0.841 | -0.869 | -1.148 |
| 2017-10-13 | 0.829 | 0.851 | -0.853 | -1.143 |
| 2017-10-16 | 0.839 | 0.862 | -0.844 | -1.13 |
| 2017-10-17 | 0.839 | 0.873 | -0.847 | -1.131 |
| 2017-10-18 | 0.849 | 0.883 | -0.843 | -1.135 |
| 2017-10-19 | 0.849 | 0.893 | -0.842 | -1.118 |
| 2017-10-20 | 0.849 | 0.893 | -0.842 | -1.118 |
| 2017-10-23 | 0.859 | 0.903 | -0.837 | -1.115 |
| 2017-10-24 | 0.87 | 0.903 | -0.831 | -1.115 |
| 2017-10-25 | 0.871 | 0.913 | -0.834 | -1.115 |
| 2017-10-26 | 0.881 | 0.923 | -0.828 | -1.103 |
| 2017-10-27 | 0.891 | 0.924 | -0.82 | -1.108 |
| 2017-10-30 | 0.901 | 0.935 | -0.807 | -1.092 |
| 2017-10-31 | 0.911 | 0.955 | -0.801 | -1.078 |
| 2017-11-01 | 0.919 | 0.957 | -0.795 | -1.086 |
| 2017-11-02 | 0.939 | 0.979 | -0.781 | -1.073 |
| 2017-11-03 | 1.019 | 1.061 | -0.702 | -0.993 |
| 2017-11-06 | 1.029 | 1.081 | -0.697 | -0.974 |
| 2017-11-07 | 1.029 | 1.08 | -0.703 | -0.978 |
| 2017-11-08 | 1.039 | 1.081 | -0.7 | -0.983 |
| 2017-11-09 | 1.049 | 1.091 | -0.693 | -0.982 |
| 2017-11-10 | 1.049 | 1.101 | -0.693 | -0.971 |
| 2017-11-13 | 1.049 | 1.101 | -0.696 | -0.974 |
| 2017-11-14 | 1.049 | 1.111 | -0.699 | -0.973 |
| 2017-11-15 | 1.049 | 1.112 | -0.702 | -0.966 |
| 2017-11-16 | 1.049 | 1.122 | -0.716 | -0.971 |
| 2017-11-20 | 1.059 | 1.117 | -0.716 | -0.978 |
| 2017-11-21 | 1.059 | 1.126 | -0.724 | -0.987 |
| 2017-11-22 | 1.059 | 1.126 | -0.732 | -0.994 |
| 2017-11-23 | 1.059 | 1.126 | -0.732 | -0.99 |
| 2017-11-24 | 1.069 | 1.126 | -0.728 | -0.996 |
| 2017-11-27 | 1.069 | 1.126 | -0.737 | -1.003 |
| 2017-11-28 | 1.069 | 1.126 | -0.739 | -0.998 |
| 2017-11-29 | 1.069 | 1.137 | -0.741 | -0.995 |
| 2017-11-30 | 1.069 | 1.138 | -0.747 | -1.002 |
| 2017-12-01 | 1.066 | 1.128 | -0.755 | -1.02 |
| 2017-12-04 | 1.066 | 1.14 | -0.768 | -1.032 |
| 2017-12-05 | 1.066 | 1.141 | -0.775 | -1.04 |
| 2017-12-06 | 1.066 | 1.141 | -0.783 | -1.038 |
| 2017-12-07 | 1.065 | 1.14 | -0.796 | -1.047 |
| 2017-12-08 | 1.076 | 1.141 | -0.799 | -1.061 |
| 2017-12-11 | 1.077 | 1.141 | -0.813 | -1.064 |
| 2017-12-12 | 1.077 | 1.141 | -0.824 | -1.078 |
| 2017-12-13 | 1.079 | 1.151 | -0.838 | -1.079 |
| 2017-12-14 | 1.091 | 1.162 | -0.84 | -1.069 |
| 2017-12-15 | 1.089 | 1.163 | -0.853 | -1.078 |
| 2017-12-18 | 1.089 | 1.164 | -0.865 | -1.088 |
| 2017-12-19 | 1.089 | 1.164 | -0.882 | -1.099 |
| 2017-12-20 | 1.089 | 1.158 | -0.898 | -1.114 |
| 2017-12-21 | 1.089 | 1.156 | -0.915 | -1.121 |
| 2017-12-22 | 1.089 | 1.156 | -0.926 | -1.132 |
| 2017-12-27 | 1.089 | 1.156 | -0.933 | -1.141 |
| 2017-12-28 | 1.089 | 1.156 | -0.935 | -1.136 |
| 2017-12-29 | 1.089 | 1.156 | -0.934 | -1.137 |
| 2018-01-02 | 1.089 | 1.156 | -0.937 | -1.139 |
| 2018-01-03 | 1.089 | 1.157 | -0.936 | -1.148 |
| 2018-01-04 | 1.089 | 1.157 | -0.944 | -1.168 |
| 2018-01-05 | 1.089 | 1.157 | -0.944 | -1.18 |
| 2018-01-08 | 1.089 | 1.157 | -0.948 | -1.181 |
| 2018-01-09 | 1.089 | 1.157 | -0.945 | -1.176 |
| 2018-01-10 | 1.089 | 1.156 | -0.949 | -1.186 |
| 2018-01-11 | 1.109 | 1.178 | -0.94 | -1.174 |
| 2018-01-12 | 1.089 | 1.156 | -0.962 | -1.203 |
| 2018-01-15 | 1.089 | 1.157 | -0.971 | -1.219 |
| 2018-01-16 | 1.089 | 1.156 | -0.974 | -1.226 |
| 2018-01-17 | 1.098 | 1.166 | -0.969 | -1.234 |
| 2018-01-18 | 1.098 | 1.171 | -0.975 | -1.248 |
| 2018-01-19 | 1.098 | 1.171 | -0.974 | -1.248 |
| 2018-01-22 | 1.098 | 1.171 | -0.971 | -1.248 |
| 2018-01-23 | 1.098 | 1.171 | -0.975 | -1.245 |
| 2018-01-24 | 1.098 | 1.172 | -0.982 | -1.251 |
| 2018-01-25 | 1.108 | 1.182 | -0.972 | -1.241 |
| 2018-01-26 | 1.108 | 1.182 | -0.972 | -1.241 |
| 2018-01-29 | 1.118 | 1.191 | -0.982 | -1.264 |
| 2018-01-30 | 1.138 | 1.201 | -0.963 | -1.253 |
| 2018-01-31 | 1.138 | 1.211 | -0.968 | -1.247 |
| 2018-02-01 | 1.158 | 1.221 | -0.957 | -1.263 |
| 2018-02-02 | 1.239 | 1.301 | -0.879 | -1.181 |
| 2018-02-05 | 1.239 | 1.301 | -0.883 | -1.183 |
| 2018-02-06 | 1.239 | 1.301 | -0.881 | -1.168 |
| 2018-02-07 | 1.239 | 1.301 | -0.89 | -1.176 |
| 2018-02-08 | 1.239 | 1.301 | -0.9 | -1.188 |
| 2018-02-09 | 1.229 | 1.301 | -0.92 | -1.203 |
| 2018-02-12 | 1.229 | 1.301 | -0.933 | -1.209 |
| 2018-02-13 | 1.229 | 1.301 | -0.939 | -1.217 |
| 2018-02-14 | 1.228 | 1.302 | -0.95 | -1.228 |
| 2018-02-15 | 1.228 | 1.301 | -0.972 | -1.271 |
| 2018-02-16 | 1.228 | 1.302 | -0.985 | -1.281 |
| 2018-02-19 | 1.239 | 1.303 | -0.982 | -1.288 |
| 2018-02-20 | 1.239 | 1.303 | -0.994 | -1.298 |
| 2018-02-21 | 1.239 | 1.301 | -1.01 | -1.316 |
| 2018-02-22 | 1.238 | 1.311 | -1.034 | -1.33 |
| 2018-02-23 | 1.238 | 1.311 | -1.046 | -1.34 |
| 2018-02-26 | 1.238 | 1.31 | -1.074 | -1.349 |
| 2018-02-27 | 1.238 | 1.311 | -1.096 | -1.361 |
| 2018-02-28 | 1.237 | 1.311 | -1.107 | -1.382 |
| 2018-03-01 | 1.237 | 1.311 | -1.115 | -1.387 |
| 2018-03-02 | 1.237 | 1.311 | -1.115 | -1.377 |
| 2018-03-05 | 1.237 | 1.311 | -1.125 | -1.378 |
| 2018-03-06 | 1.237 | 1.311 | -1.137 | -1.392 |
| 2018-03-07 | 1.237 | 1.311 | -1.147 | -1.399 |
| 2018-03-08 | 1.237 | 1.311 | -1.161 | -1.413 |
| 2018-03-09 | 1.227 | 1.311 | -1.189 | -1.424 |
| 2018-03-12 | 1.227 | 1.311 | -1.207 | -1.443 |
| 2018-03-13 | 1.227 | 1.311 | -1.224 | -1.458 |
| 2018-03-14 | 1.227 | 1.311 | -1.245 | -1.47 |
| 2018-03-15 | 1.228 | 1.311 | -1.278 | -1.481 |
| 2018-03-16 | 1.228 | 1.312 | -1.302 | -1.494 |
| 2018-03-19 | 1.229 | 1.312 | -1.322 | -1.513 |
| 2018-03-20 | 1.229 | 1.311 | -1.348 | -1.531 |
| 2018-03-21 | 1.229 | 1.311 | -1.371 | -1.556 |
| 2018-03-22 | 1.229 | 1.311 | -1.386 | -1.557 |
| 2018-03-23 | 1.229 | 1.31 | -1.392 | -1.546 |
| 2018-03-26 | 1.229 | 1.311 | -1.395 | -1.552 |
| 2018-03-27 | 1.229 | 1.311 | -1.402 | -1.551 |
| 2018-03-28 | 1.229 | 1.311 | -1.408 | -1.539 |
| 2018-03-29 | 1.228 | 1.31 | -1.412 | -1.543 |
| 2018-04-03 | 1.228 | 1.31 | -1.421 | -1.55 |
| 2018-04-04 | 1.228 | 1.31 | -1.425 | -1.561 |
| 2018-04-05 | 1.228 | 1.311 | -1.431 | -1.58 |
| 2018-04-06 | 1.229 | 1.311 | -1.437 | -1.588 |
| 2018-04-09 | 1.229 | 1.311 | -1.437 | -1.584 |
| 2018-04-10 | 1.229 | 1.311 | -1.439 | -1.584 |
| 2018-04-11 | 1.229 | 1.31 | -1.442 | -1.589 |
| 2018-04-12 | 1.229 | 1.311 | -1.448 | -1.597 |
| 2018-04-13 | 1.229 | 1.31 | -1.453 | -1.611 |
| 2018-04-16 | 1.229 | 1.309 | -1.455 | -1.624 |
| 2018-04-17 | 1.228 | 1.319 | -1.455 | -1.616 |
| 2018-04-18 | 1.228 | 1.309 | -1.459 | -1.628 |
| 2018-04-19 | 1.228 | 1.309 | -1.459 | -1.628 |
| 2018-04-20 | 1.228 | 1.309 | -1.459 | -1.628 |
| 2018-04-23 | 1.228 | 1.309 | -1.46 | -1.649 |
| 2018-04-24 | 1.228 | 1.309 | -1.462 | -1.649 |
| 2018-04-25 | 1.228 | 1.309 | -1.466 | -1.652 |
| 2018-04-26 | 1.228 | 1.309 | -1.459 | -1.65 |
| 2018-04-27 | 1.229 | 1.309 | -1.458 | -1.66 |
| 2018-04-30 | 1.229 | 1.309 | -1.463 | -1.65 |
| 2018-05-02 | 1.229 | 1.309 | -1.463 | -1.657 |
| 2018-05-03 | 1.228 | 1.309 | -1.463 | -1.653 |
| 2018-05-04 | 1.228 | 1.31 | -1.469 | -1.657 |
| 2018-05-07 | 1.228 | 1.309 | -1.469 | -1.657 |
| 2018-05-09 | 1.227 | 1.309 | -1.456 | -1.651 |
| 2018-05-10 | 1.226 | 1.309 | -1.455 | -1.648 |
| 2018-05-11 | 1.227 | 1.309 | -1.442 | -1.646 |
| 2018-05-14 | 1.226 | 1.31 | -1.43 | -1.637 |
| 2018-05-15 | 1.226 | 1.308 | -1.421 | -1.634 |
| 2018-05-16 | 1.226 | 1.308 | -1.426 | -1.641 |
| 2018-05-17 | 1.226 | 1.308 | -1.431 | -1.646 |
| 2018-05-18 | 1.226 | 1.309 | -1.429 | -1.645 |
| 2018-05-21 | 1.225 | 1.307 | -1.43 | -1.645 |
| 2018-05-22 | 1.224 | 1.309 | -1.43 | -1.644 |
| 2018-05-23 | 1.223 | 1.309 | -1.43 | -1.634 |
| 2018-05-24 | 1.224 | 1.307 | -1.419 | -1.617 |
| 2018-05-25 | 1.223 | 1.308 | -1.418 | -1.611 |
| 2018-05-28 | 1.222 | 1.306 | -1.418 | -1.611 |
| 2018-05-29 | 1.221 | 1.306 | -1.407 | -1.588 |
| 2018-05-30 | 1.221 | 1.304 | -1.4 | -1.58 |
| 2018-05-31 | 1.221 | 1.304 | -1.421 | -1.598 |
| 2018-06-01 | 1.221 | 1.304 | -1.418 | -1.604 |
| 2018-06-04 | 1.221 | 1.304 | -1.414 | -1.62 |
| 2018-06-05 | 1.222 | 1.302 | -1.419 | -1.619 |
| 2018-06-06 | 1.221 | 1.3 | -1.421 | -1.621 |
| 2018-06-07 | 1.221 | 1.3 | -1.427 | -1.634 |
| 2018-06-08 | 1.221 | 1.3 | -1.426 | -1.62 |
| 2018-06-11 | 1.241 | 1.311 | -1.413 | -1.628 |
| 2018-06-12 | 1.241 | 1.321 | -1.416 | -1.625 |
| 2018-06-13 | 1.241 | 1.321 | -1.421 | -1.627 |
| 2018-06-14 | 1.251 | 1.321 | -1.405 | -1.632 |
| 2018-06-15 | 1.241 | 1.323 | -1.406 | -1.632 |
| 2018-06-18 | 1.253 | 1.334 | -1.395 | -1.622 |
| 2018-06-19 | 1.253 | 1.331 | -1.4 | -1.613 |
| 2018-06-20 | 1.253 | 1.332 | -1.402 | -1.622 |
| 2018-06-21 | 1.253 | 1.332 | -1.405 | -1.62 |
| 2018-06-22 | 1.253 | 1.34 | -1.409 | -1.617 |
| 2018-06-25 | 1.254 | 1.341 | -1.407 | -1.606 |
| 2018-06-26 | 1.253 | 1.341 | -1.406 | -1.611 |
| 2018-06-27 | 1.254 | 1.341 | -1.404 | -1.603 |
| 2018-06-28 | 1.484 | 1.531 | -1.177 | -1.413 |
| 2018-06-29 | 1.481 | 1.531 | -1.176 | -1.414 |
| 2018-07-02 | 1.481 | 1.531 | -1.182 | -1.422 |
| 2018-07-03 | 1.481 | 1.531 | -1.177 | -1.423 |
| 2018-07-04 | 1.491 | 1.541 | -1.167 | -1.413 |
| 2018-07-09 | 1.491 | 1.551 | -1.163 | -1.406 |
| 2018-07-10 | 1.491 | 1.55 | -1.167 | -1.411 |
| 2018-07-11 | 1.501 | 1.559 | -1.157 | -1.398 |
| 2018-07-12 | 1.501 | 1.559 | -1.159 | -1.405 |
| 2018-07-13 | 1.501 | 1.569 | -1.156 | -1.397 |
| 2018-07-16 | 1.501 | 1.569 | -1.153 | -1.398 |
| 2018-07-17 | 1.511 | 1.579 | -1.152 | -1.396 |
| 2018-07-18 | 1.501 | 1.569 | -1.168 | -1.411 |
| 2018-07-19 | 1.511 | 1.569 | -1.157 | -1.417 |
| 2018-07-20 | 1.501 | 1.569 | -1.162 | -1.412 |
| 2018-07-23 | 1.511 | 1.569 | -1.145 | -1.409 |
| 2018-07-24 | 1.511 | 1.579 | -1.145 | -1.408 |
| 2018-07-25 | 1.521 | 1.589 | -1.137 | -1.398 |
| 2018-07-26 | 1.52 | 1.589 | -1.139 | -1.407 |
| 2018-07-27 | 1.52 | 1.589 | -1.142 | -1.411 |
| 2018-07-30 | 1.529 | 1.609 | -1.133 | -1.391 |
| 2018-07-31 | 1.539 | 1.608 | -1.129 | -1.398 |
| 2018-08-01 | 1.549 | 1.627 | -1.118 | -1.382 |
| 2018-08-02 | 1.559 | 1.626 | -1.1 | -1.378 |
| 2018-08-03 | 1.739 | 1.786 | -0.923 | -1.217 |
| 2018-08-06 | 1.759 | 1.816 | -0.903 | -1.187 |
| 2018-08-07 | 1.769 | 1.826 | -0.891 | -1.174 |
| 2018-08-08 | 1.769 | 1.836 | -0.891 | -1.168 |
| 2018-08-09 | 1.779 | 1.843 | -0.878 | -1.158 |
| 2018-08-10 | 1.779 | 1.839 | -0.859 | -1.146 |
| 2018-08-13 | 1.779 | 1.846 | -0.854 | -1.123 |
| 2018-08-14 | 1.779 | 1.846 | -0.855 | -1.134 |
| 2018-08-15 | 1.779 | 1.846 | -0.852 | -1.135 |
| 2018-08-16 | 1.779 | 1.846 | -0.862 | -1.137 |
| 2018-08-17 | 1.789 | 1.847 | -0.842 | -1.133 |
| 2018-08-20 | 1.789 | 1.857 | -0.84 | -1.123 |
| 2018-08-21 | 1.799 | 1.867 | -0.83 | -1.108 |
| 2018-08-22 | 1.799 | 1.877 | -0.832 | -1.098 |
| 2018-08-23 | 1.799 | 1.877 | -0.831 | -1.102 |
| 2018-08-24 | 1.799 | 1.876 | -0.837 | -1.11 |
| 2018-08-27 | 1.809 | 1.876 | -0.827 | -1.11 |
| 2018-08-28 | 1.809 | 1.886 | -0.825 | -1.108 |
| 2018-08-29 | 1.809 | 1.885 | -0.823 | -1.113 |
| 2018-08-30 | 1.809 | 1.896 | -0.831 | -1.112 |
| 2018-08-31 | 1.819 | 1.896 | -0.821 | -1.11 |
| 2018-09-03 | 1.819 | 1.896 | -0.816 | -1.109 |
| 2018-09-04 | 1.819 | 1.906 | -0.823 | -1.103 |
| 2018-09-05 | 1.829 | 1.907 | -0.807 | -1.104 |
| 2018-09-06 | 1.829 | 1.917 | -0.817 | -1.099 |
| 2018-09-07 | 1.829 | 1.907 | -0.821 | -1.106 |
| 2018-09-10 | 1.829 | 1.917 | -0.824 | -1.113 |
| 2018-09-11 | 1.839 | 1.936 | -0.814 | -1.098 |
| 2018-09-12 | 1.849 | 1.946 | -0.802 | -1.085 |
| 2018-09-13 | 1.859 | 1.948 | -0.794 | -1.093 |
| 2018-09-14 | 1.859 | 1.958 | -0.797 | -1.09 |
| 2018-09-17 | 1.859 | 1.959 | -0.799 | -1.089 |
| 2018-09-18 | 1.869 | 1.968 | -0.787 | -1.08 |
| 2018-09-19 | 1.878 | 1.977 | -0.793 | -1.077 |
| 2018-09-20 | 1.879 | 1.978 | -0.806 | -1.087 |
| 2018-09-21 | 1.879 | 1.988 | -0.813 | -1.088 |
| 2018-09-24 | 1.879 | 1.987 | -0.814 | -1.089 |
| 2018-09-25 | 1.889 | 1.985 | -0.811 | -1.092 |
| 2018-09-26 | 1.899 | 1.994 | -0.806 | -1.084 |
| 2018-09-27 | 2.018 | 2.051 | -0.696 | -1.027 |
| 2018-10-01 | 2.037 | 2.058 | -0.678 | -1.026 |
| 2018-10-02 | 2.048 | 2.067 | -0.678 | -1.015 |
| 2018-10-03 | 2.048 | 2.077 | -0.678 | -1.007 |
| 2018-10-04 | 2.058 | 2.089 | -0.67 | -1.027 |
| 2018-10-05 | 2.058 | 2.088 | -0.668 | -1.028 |
| 2018-10-08 | 2.058 | 2.088 | -0.674 | -1.028 |
| 2018-10-09 | 2.068 | 2.086 | -0.67 | -1.032 |
| 2018-10-10 | 2.068 | 2.096 | -0.675 | -1.029 |
| 2018-10-11 | 2.068 | 2.106 | -0.686 | -1.004 |
| 2018-10-12 | 2.068 | 2.117 | -0.686 | -1.003 |
| 2018-10-15 | 2.078 | 2.116 | -0.689 | -1.007 |
| 2018-10-16 | 2.078 | 2.126 | -0.689 | -0.997 |
| 2018-10-17 | 2.078 | 2.126 | -0.69 | -0.996 |
| 2018-10-18 | 2.077 | 2.125 | -0.709 | -1.031 |
| 2018-10-19 | 2.087 | 2.124 | -0.707 | -1.05 |
| 2018-10-22 | 2.087 | 2.121 | -0.717 | -1.061 |
| 2018-10-23 | 2.087 | 2.129 | -0.72 | -1.054 |
| 2018-10-24 | 2.097 | 2.129 | -0.71 | -1.054 |
| 2018-10-25 | 2.097 | 2.119 | -0.71 | -1.064 |
| 2018-10-26 | 2.108 | 2.128 | -0.73 | -1.077 |
| 2018-10-29 | 2.118 | 2.138 | -0.72 | -1.067 |
| 2018-10-30 | 2.118 | 2.138 | -0.72 | -1.067 |
| 2018-10-31 | 2.128 | 2.149 | -0.748 | -1.084 |
| 2018-11-01 | 2.138 | 2.159 | -0.739 | -1.074 |
| 2018-11-02 | 2.278 | 2.288 | -0.632 | -0.965 |
| 2018-11-05 | 2.288 | 2.288 | -0.619 | -0.977 |
| 2018-11-06 | 2.288 | 2.298 | -0.619 | -0.967 |
| 2018-11-07 | 2.287 | 2.309 | -0.631 | -0.965 |
| 2018-11-08 | 2.297 | 2.319 | -0.621 | -0.955 |
| 2018-11-09 | 2.306 | 2.328 | -0.628 | -0.964 |
| 2018-11-12 | 2.306 | 2.328 | -0.624 | -0.955 |
| 2018-11-13 | 2.306 | 2.328 | -0.624 | -0.955 |
| 2018-11-14 | 2.306 | 2.337 | -0.639 | -0.94 |
| 2018-11-15 | 2.316 | 2.347 | -0.64 | -0.918 |
| 2018-11-16 | 2.316 | 2.347 | -0.64 | -0.918 |
| 2018-11-19 | 2.316 | 2.348 | -0.646 | -0.907 |
| 2018-11-20 | 2.326 | 2.358 | -0.643 | -0.887 |
| 2018-11-21 | 2.326 | 2.358 | -0.643 | -0.887 |
| 2018-11-22 | 2.326 | 2.358 | -0.679 | -0.9 |
| 2018-11-23 | 2.336 | 2.367 | -0.671 | -0.901 |
| 2018-11-26 | 2.336 | 2.366 | -0.687 | -0.908 |
| 2018-11-27 | 2.336 | 2.366 | -0.687 | -0.908 |
| 2018-11-28 | 2.336 | 2.366 | -0.687 | -0.908 |
| 2018-11-29 | 2.336 | 2.366 | -0.687 | -0.908 |
| 2018-11-30 | 2.336 | 2.366 | -0.716 | -0.9 |
| 2018-12-03 | 2.326 | 2.353 | -0.741 | -0.928 |
| 2018-12-04 | 2.326 | 2.352 | -0.729 | -0.923 |
| 2018-12-05 | 2.326 | 2.351 | -0.756 | -0.916 |
| 2018-12-06 | 2.325 | 2.35 | -0.757 | -0.902 |
| 2018-12-07 | 2.325 | 2.347 | -0.761 | -0.891 |
| 2018-12-10 | 2.324 | 2.344 | -0.766 | -0.874 |
| 2018-12-11 | 2.322 | 2.341 | -0.769 | -0.88 |
| 2018-12-12 | 2.322 | 2.341 | -0.768 | -0.891 |
| 2018-12-13 | 2.331 | 2.339 | -0.768 | -0.902 |
| 2018-12-14 | 2.331 | 2.338 | -0.781 | -0.888 |
| 2018-12-17 | 2.331 | 2.337 | -0.784 | -0.894 |
| 2018-12-18 | 2.331 | 2.335 | -0.772 | -0.851 |
| 2018-12-19 | 2.329 | 2.334 | -0.77 | -0.843 |
| 2018-12-20 | 2.329 | 2.334 | -0.77 | -0.843 |
| 2018-12-21 | 2.329 | 2.334 | -0.77 | -0.843 |
| 2018-12-27 | 2.319 | 2.319 | -0.793 | -0.832 |
| 2018-12-28 | 2.33 | 2.329 | -0.777 | -0.803 |
| 2018-12-31 | 2.319 | 2.327 | -0.798 | -0.795 |
| 2019-01-02 | 2.319 | 2.317 | -0.798 | -0.805 |
| 2019-01-03 | 2.319 | 2.317 | -0.798 | -0.805 |
| 2019-01-04 | 2.319 | 2.327 | -0.798 | -0.795 |
| 2019-01-07 | 2.32 | 2.329 | -0.787 | -0.785 |
| 2019-01-08 | 2.32 | 2.329 | -0.787 | -0.785 |
| 2019-01-09 | 2.318 | 2.328 | -0.789 | -0.829 |
| 2019-01-10 | 2.318 | 2.328 | -0.787 | -0.809 |
| 2019-01-11 | 2.318 | 2.328 | -0.787 | -0.809 |
| 2019-01-14 | 2.318 | 2.328 | -0.769 | -0.801 |
| 2019-01-15 | 2.318 | 2.328 | -0.769 | -0.801 |
| 2019-01-16 | 2.318 | 2.327 | -0.77 | -0.82 |
| 2019-01-17 | 2.318 | 2.327 | -0.77 | -0.82 |
| 2019-01-18 | 2.318 | 2.336 | -0.751 | -0.81 |
| 2019-01-21 | 2.318 | 2.336 | -0.751 | -0.81 |
| 2019-01-22 | 2.318 | 2.335 | -0.769 | -0.817 |
| 2019-01-23 | 2.318 | 2.336 | -0.761 | -0.815 |
| 2019-01-24 | 2.306 | 2.335 | -0.765 | -0.809 |
| 2019-01-25 | 2.306 | 2.335 | -0.765 | -0.809 |
| 2019-01-28 | 2.307 | 2.332 | -0.751 | -0.81 |
| 2019-01-29 | 2.296 | 2.329 | -0.754 | -0.804 |
| 2019-01-30 | 2.296 | 2.319 | -0.754 | -0.814 |
| 2019-01-31 | 2.298 | 2.319 | -0.747 | -0.773 |
| 2019-02-01 | 2.298 | 2.32 | -0.743 | -0.752 |
| 2019-02-04 | 2.298 | 2.31 | -0.743 | -0.762 |
| 2019-02-05 | 2.298 | 2.31 | -0.743 | -0.762 |
| 2019-02-06 | 2.298 | 2.308 | -0.748 | -0.762 |
| 2019-02-07 | 2.298 | 2.308 | -0.707 | -0.748 |
| 2019-02-08 | 2.298 | 2.309 | -0.708 | -0.736 |
| 2019-02-11 | 2.298 | 2.309 | -0.698 | -0.724 |
| 2019-02-12 | 2.298 | 2.309 | -0.698 | -0.724 |
| 2019-02-13 | 2.308 | 2.298 | -0.684 | -0.726 |
| 2019-02-14 | 2.308 | 2.298 | -0.694 | -0.727 |
| 2019-02-15 | 2.318 | 2.298 | -0.684 | -0.727 |
| 2019-02-18 | 2.328 | 2.298 | -0.624 | -0.717 |
| 2019-02-19 | 2.328 | 2.298 | -0.624 | -0.717 |
| 2019-02-20 | 2.328 | 2.298 | -0.643 | -0.684 |
| 2019-02-21 | 2.33 | 2.298 | -0.631 | -0.699 |
| 2019-02-22 | 2.33 | 2.298 | -0.626 | -0.702 |
| 2019-02-25 | 2.329 | 2.308 | -0.619 | -0.683 |
| 2019-02-26 | 2.329 | 2.308 | -0.619 | -0.683 |
| 2019-02-27 | 2.33 | 2.308 | -0.606 | -0.666 |
| 2019-02-28 | 2.329 | 2.308 | -0.595 | -0.665 |
| 2019-03-01 | 2.339 | 2.308 | -0.585 | -0.665 |
| 2019-03-04 | 2.339 | 2.308 | -0.578 | -0.683 |
| 2019-03-05 | 2.338 | 2.308 | -0.577 | -0.684 |
| 2019-03-06 | 2.338 | 2.308 | -0.577 | -0.684 |
| 2019-03-07 | 2.338 | 2.318 | -0.577 | -0.674 |
| 2019-03-08 | 2.338 | 2.308 | -0.577 | -0.684 |
| 2019-03-11 | 2.338 | 2.308 | -0.578 | -0.669 |
| 2019-03-12 | 2.339 | 2.308 | -0.563 | -0.668 |
| 2019-03-13 | 2.34 | 2.309 | -0.581 | -0.659 |
| 2019-03-14 | 2.339 | 2.309 | -0.585 | -0.646 |
| 2019-03-15 | 2.339 | 2.309 | -0.585 | -0.646 |
| 2019-03-18 | 2.34 | 2.309 | -0.603 | -0.618 |
| 2019-03-19 | 2.34 | 2.309 | -0.603 | -0.618 |
| 2019-03-20 | 2.339 | 2.309 | -0.577 | -0.613 |
| 2019-03-21 | 2.339 | 2.308 | -0.572 | -0.594 |
| 2019-03-22 | 2.339 | 2.308 | -0.58 | -0.587 |
| 2019-03-25 | 2.33 | 2.308 | -0.589 | -0.546 |
| 2019-03-26 | 2.329 | 2.308 | -0.577 | -0.525 |
| 2019-03-27 | 2.329 | 2.309 | -0.581 | -0.483 |
| 2019-03-28 | 2.329 | 2.309 | -0.581 | -0.483 |
| 2019-03-29 | 2.331 | 2.312 | -0.58 | -0.511 |
| 2019-04-01 | 2.33 | 2.312 | -0.575 | -0.53 |
| 2019-04-02 | 2.331 | 2.312 | -0.582 | -0.533 |
| 2019-04-03 | 2.33 | 2.312 | -0.578 | -0.549 |
| 2019-04-04 | 2.33 | 2.312 | -0.569 | -0.536 |
| 2019-04-05 | 2.33 | 2.312 | -0.572 | -0.551 |
| 2019-04-08 | 2.33 | 2.312 | -0.564 | -0.55 |
| 2019-04-09 | 2.33 | 2.312 | -0.561 | -0.554 |
| 2019-04-10 | 2.33 | 2.312 | -0.583 | -0.54 |
| 2019-04-11 | 2.33 | 2.312 | -0.577 | -0.534 |
| 2019-04-12 | 2.33 | 2.322 | -0.581 | -0.538 |
| 2019-04-15 | 2.33 | 2.321 | -0.568 | -0.545 |
| 2019-04-16 | 2.33 | 2.322 | -0.581 | -0.545 |
| 2019-04-17 | 2.331 | 2.322 | -0.571 | -0.552 |
| 2019-04-18 | 2.331 | 2.322 | -0.571 | -0.552 |
| 2019-04-23 | 2.331 | 2.332 | -0.56 | -0.516 |
| 2019-04-24 | 2.332 | 2.332 | -0.566 | -0.505 |
| 2019-04-25 | 2.332 | 2.332 | -0.562 | -0.496 |
| 2019-04-26 | 2.34 | 2.343 | -0.553 | -0.487 |
| 2019-04-29 | 2.351 | 2.344 | -0.539 | -0.483 |
| 2019-04-30 | 2.36 | 2.344 | -0.526 | -0.487 |
| 2019-05-02 | 2.359 | 2.344 | -0.515 | -0.507 |
| 2019-05-03 | 2.509 | 2.454 | -0.36 | -0.406 |
| 2019-05-06 | 2.518 | 2.454 | -0.35 | -0.406 |
| 2019-05-07 | 2.518 | 2.455 | -0.352 | -0.381 |
| 2019-05-09 | 2.518 | 2.455 | -0.352 | -0.381 |
| 2019-05-10 | 2.509 | 2.458 | -0.328 | -0.353 |
| 2019-05-13 | 2.511 | 2.448 | -0.318 | -0.342 |
| 2019-05-14 | 2.511 | 2.451 | -0.324 | -0.309 |
| 2019-05-15 | 2.511 | 2.445 | -0.325 | -0.312 |
| 2019-05-16 | 2.512 | 2.448 | -0.32 | -0.294 |
| 2019-05-17 | 2.512 | 2.448 | -0.32 | -0.294 |
| 2019-05-20 | 2.514 | 2.455 | -0.323 | -0.327 |
| 2019-05-21 | 2.513 | 2.465 | -0.323 | -0.334 |
| 2019-05-22 | 2.511 | 2.465 | -0.325 | -0.346 |
| 2019-05-23 | 2.5 | 2.458 | -0.331 | -0.335 |
| 2019-05-24 | 2.5 | 2.458 | -0.331 | -0.335 |
| 2019-05-27 | 2.5 | 2.458 | -0.331 | -0.335 |
| 2019-05-28 | 2.505 | 2.463 | -0.334 | -0.29 |
| 2019-05-29 | 2.505 | 2.463 | -0.334 | -0.29 |
| 2019-05-30 | 2.512 | 2.478 | -0.312 | -0.2 |
| 2019-05-31 | 2.512 | 2.478 | -0.312 | -0.2 |
| 2019-06-03 | 2.513 | 2.485 | -0.288 | -0.103 |
| 2019-06-04 | 2.502 | 2.477 | -0.294 | -0.105 |
| 2019-06-05 | 2.5 | 2.477 | -0.292 | -0.083 |
| 2019-06-06 | 2.5 | 2.477 | -0.292 | -0.083 |
| 2019-06-07 | 2.499 | 2.475 | -0.271 | -0.046 |
| 2019-06-10 | 2.488 | 2.468 | -0.266 | -0.048 |
| 2019-06-11 | 2.489 | 2.468 | -0.28 | -0.053 |
| 2019-06-12 | 2.488 | 2.463 | -0.258 | -0.043 |
| 2019-06-13 | 2.488 | 2.458 | -0.24 | -0.016 |
| 2019-06-14 | 2.488 | 2.461 | -0.232 | 0.043 |
| 2019-06-17 | 2.49 | 2.467 | -0.248 | 0.003 |
| 2019-06-18 | 2.492 | 2.474 | -0.217 | 0.026 |
| 2019-06-19 | 2.506 | 2.498 | -0.216 | -0.008 |
| 2019-06-20 | 2.508 | 2.501 | -0.173 | 0.128 |
| 2019-06-21 | 2.514 | 2.502 | -0.179 | 0.088 |
| 2019-06-24 | 2.513 | 2.5 | -0.163 | 0.111 |
| 2019-06-25 | 2.515 | 2.5 | -0.141 | 0.143 |
| 2019-06-26 | 2.515 | 2.5 | -0.141 | 0.143 |
| 2019-06-27 | 2.514 | 2.503 | -0.149 | 0.105 |
| 2019-06-28 | 2.515 | 2.504 | -0.15 | 0.112 |
| 2019-07-01 | 2.516 | 2.507 | -0.162 | 0.088 |
| 2019-07-02 | 2.521 | 2.523 | -0.143 | 0.087 |
| 2019-07-03 | 2.523 | 2.533 | -0.119 | 0.11 |
| 2019-07-04 | 2.524 | 2.548 | -0.133 | 0.111 |
| 2019-07-08 | 2.526 | 2.548 | -0.168 | 0.029 |
| 2019-07-09 | 2.528 | 2.538 | -0.171 | 0.007 |
| 2019-07-10 | 2.528 | 2.533 | -0.17 | -0.006 |
| 2019-07-11 | 2.534 | 2.557 | -0.133 | 0.087 |
| 2019-07-12 | 2.533 | 2.56 | -0.152 | 0.049 |
| 2019-07-15 | 2.523 | 2.567 | -0.143 | 0.07 |
| 2019-07-16 | 2.523 | 2.567 | -0.143 | 0.07 |
| 2019-07-17 | 2.529 | 2.578 | -0.143 | 0.063 |
| 2019-07-18 | 2.53 | 2.583 | -0.118 | 0.088 |
| 2019-07-19 | 2.535 | 2.588 | -0.099 | 0.122 |
| 2019-07-22 | 2.534 | 2.587 | -0.123 | 0.092 |
| 2019-07-23 | 2.533 | 2.591 | -0.115 | 0.089 |
| 2019-07-24 | 2.536 | 2.601 | -0.107 | 0.101 |
| 2019-07-25 | 2.536 | 2.601 | -0.107 | 0.101 |
| 2019-07-26 | 2.528 | 2.584 | -0.106 | 0.073 |
| 2019-07-29 | 2.527 | 2.584 | -0.095 | 0.072 |
| 2019-07-30 | 2.534 | 2.571 | -0.093 | 0.082 |
| 2019-07-31 | 2.535 | 2.573 | -0.106 | 0.081 |
| 2019-08-01 | 2.537 | 2.57 | -0.127 | 0.031 |
| 2019-08-02 | 2.54 | 2.564 | -0.079 | 0.144 |
| 2019-08-05 | 2.534 | 2.558 | -0.059 | 0.213 |
| 2019-08-06 | 2.539 | 2.569 | -0.037 | 0.256 |
| 2019-08-07 | 2.54 | 2.562 | -0.034 | 0.263 |
| 2019-08-08 | 2.538 | 2.579 | -0.041 | 0.247 |
| 2019-08-09 | 2.544 | 2.573 | -0.036 | 0.242 |
| 2019-08-12 | 2.54 | 2.582 | -0.035 | 0.239 |
| 2019-08-13 | 2.542 | 2.577 | -0.018 | 0.25 |
| 2019-08-14 | 2.546 | 2.56 | -0.028 | 0.181 |
| 2019-08-15 | 2.544 | 2.563 | 0.016 | 0.277 |
| 2019-08-16 | 2.56 | 2.585 | 0.004 | 0.255 |
| 2019-08-19 | 2.562 | 2.608 | -0.011 | 0.257 |
| 2019-08-20 | 2.561 | 2.605 | -0.01 | 0.262 |
| 2019-08-21 | 2.563 | 2.609 | -0.008 | 0.256 |
| 2019-08-22 | 2.558 | 2.586 | 0.008 | 0.227 |
| 2019-08-23 | 2.552 | 2.558 | -0.004 | 0.172 |
| 2019-08-26 | 2.552 | 2.558 | -0.004 | 0.172 |
| 2019-08-27 | 2.558 | 2.569 | 0.023 | 0.251 |
| 2019-08-28 | 2.558 | 2.569 | 0.023 | 0.251 |
| 2019-08-29 | 2.558 | 2.569 | 0.023 | 0.251 |
| 2019-08-30 | 2.558 | 2.569 | 0.023 | 0.251 |
| 2019-09-02 | 2.558 | 2.569 | 0.023 | 0.251 |
| 2019-09-03 | 2.558 | 2.569 | 0.023 | 0.251 |
| 2019-09-04 | 2.583 | 2.579 | 0.028 | 0.303 |
| 2019-09-05 | 2.583 | 2.579 | 0.028 | 0.303 |
| 2019-09-06 | 2.577 | 2.558 | 0.006 | 0.251 |
| 2019-09-09 | 2.573 | 2.56 | 0.002 | 0.251 |
| 2019-09-10 | 2.575 | 2.57 | 0.008 | 0.23 |
| 2019-09-11 | 2.57 | 2.573 | 0.013 | 0.191 |
| 2019-09-12 | 2.57 | 2.573 | 0.013 | 0.191 |
| 2019-09-13 | 2.54 | 2.525 | 0.001 | 0.151 |
| 2019-09-16 | 2.534 | 2.509 | -0.005 | 0.13 |
| 2019-09-17 | 2.534 | 2.509 | -0.005 | 0.13 |
| 2019-09-18 | 2.536 | 2.506 | -0.016 | 0.136 |
| 2019-09-19 | 2.536 | 2.506 | -0.016 | 0.136 |
| 2019-09-20 | 2.536 | 2.506 | -0.016 | 0.136 |
| 2019-09-23 | 2.54 | 2.502 | 0.034 | 0.167 |
| 2019-09-24 | 2.54 | 2.502 | 0.034 | 0.167 |
| 2019-09-25 | 2.54 | 2.502 | 0.034 | 0.167 |
| 2019-09-26 | 2.563 | 2.544 | 0.046 | 0.2 |
| 2019-09-27 | 2.572 | 2.555 | 0.061 | 0.187 |
| 2019-09-30 | 2.578 | 2.57 | 0.075 | 0.208 |
| 2019-10-01 | 2.588 | 2.58 | 0.071 | 0.215 |
| 2019-10-02 | 2.585 | 2.583 | 0.104 | 0.302 |
| 2019-10-03 | 2.595 | 2.588 | 0.127 | 0.346 |
| 2019-10-04 | 2.595 | 2.578 | 0.127 | 0.336 |
| 2019-10-07 | 2.595 | 2.588 | 0.127 | 0.346 |
| 2019-10-08 | 2.587 | 2.6 | 0.16 | 0.381 |
| 2019-10-09 | 2.588 | 2.603 | 0.186 | 0.388 |
| 2019-10-10 | 2.588 | 2.596 | 0.184 | 0.374 |
| 2019-10-11 | 2.588 | 2.596 | 0.184 | 0.374 |
| 2019-10-14 | 2.586 | 2.581 | 0.169 | 0.307 |
| 2019-10-15 | 2.588 | 2.583 | 0.168 | 0.306 |
| 2019-10-16 | 2.598 | 2.593 | 0.178 | 0.316 |
| 2019-10-17 | 2.59 | 2.584 | 0.214 | 0.297 |
| 2019-10-18 | 2.587 | 2.588 | 0.227 | 0.303 |
| 2019-10-21 | 2.588 | 2.584 | 0.246 | 0.329 |
| 2019-10-22 | 2.584 | 2.574 | 0.244 | 0.323 |
| 2019-10-23 | 2.582 | 2.578 | 0.24 | 0.347 |
| 2019-10-24 | 2.584 | 2.568 | 0.244 | 0.319 |
| 2019-10-25 | 2.584 | 2.568 | 0.244 | 0.319 |